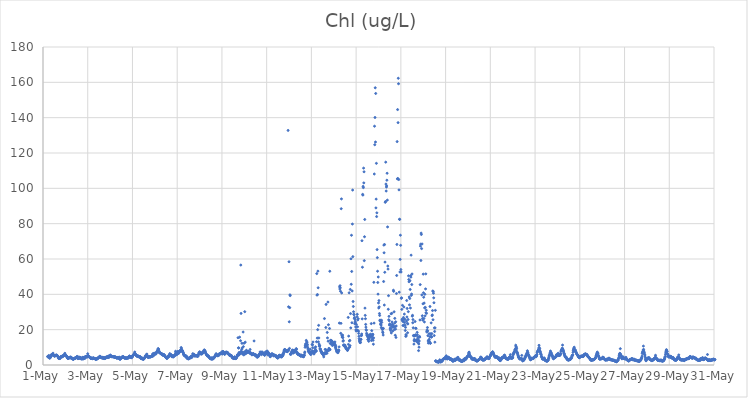
| Category | Chl (ug/L) |
|---|---|
| 44317.208333333336 | 4.81 |
| 44317.21875 | 4.85 |
| 44317.229166666664 | 4.45 |
| 44317.239583333336 | 4.85 |
| 44317.25 | 4.82 |
| 44317.260416666664 | 5.39 |
| 44317.270833333336 | 4.78 |
| 44317.28125 | 4.25 |
| 44317.291666666664 | 3.85 |
| 44317.302083333336 | 4.04 |
| 44317.3125 | 4.4 |
| 44317.322916666664 | 4.07 |
| 44317.333333333336 | 4.47 |
| 44317.34375 | 4.68 |
| 44317.354166666664 | 5.03 |
| 44317.364583333336 | 5.76 |
| 44317.375 | 5.72 |
| 44317.385416666664 | 5.77 |
| 44317.395833333336 | 5.52 |
| 44317.40625 | 5.75 |
| 44317.416666666664 | 5.65 |
| 44317.427083333336 | 5.99 |
| 44317.4375 | 5.89 |
| 44317.447916666664 | 6.69 |
| 44317.458333333336 | 5.69 |
| 44317.46875 | 5.51 |
| 44317.479166666664 | 5.47 |
| 44317.489583333336 | 5.21 |
| 44317.5 | 5.47 |
| 44317.510416666664 | 5.28 |
| 44317.520833333336 | 4.89 |
| 44317.53125 | 5.23 |
| 44317.541666666664 | 5.25 |
| 44317.552083333336 | 5.5 |
| 44317.5625 | 5.34 |
| 44317.572916666664 | 5.44 |
| 44317.583333333336 | 5.46 |
| 44317.59375 | 5.59 |
| 44317.604166666664 | 5.67 |
| 44317.614583333336 | 5.22 |
| 44317.625 | 5.27 |
| 44317.635416666664 | 5.4 |
| 44317.645833333336 | 5.12 |
| 44317.65625 | 4.91 |
| 44317.666666666664 | 4.84 |
| 44317.677083333336 | 4.6 |
| 44317.6875 | 3.92 |
| 44317.697916666664 | 3.87 |
| 44317.708333333336 | 3.83 |
| 44317.71875 | 3.63 |
| 44317.729166666664 | 3.79 |
| 44317.739583333336 | 3.96 |
| 44317.75 | 3.7 |
| 44317.760416666664 | 3.65 |
| 44317.770833333336 | 4.29 |
| 44317.78125 | 4.44 |
| 44317.791666666664 | 4.73 |
| 44317.802083333336 | 4.8 |
| 44317.8125 | 4.52 |
| 44317.822916666664 | 4.49 |
| 44317.833333333336 | 4.74 |
| 44317.84375 | 4.87 |
| 44317.854166666664 | 5 |
| 44317.864583333336 | 4.65 |
| 44317.875 | 5.2 |
| 44317.885416666664 | 5.09 |
| 44317.895833333336 | 5.11 |
| 44317.90625 | 5.05 |
| 44317.916666666664 | 5.09 |
| 44317.927083333336 | 5.32 |
| 44317.9375 | 5.32 |
| 44317.947916666664 | 5.9 |
| 44317.958333333336 | 5.94 |
| 44317.96875 | 5.86 |
| 44317.979166666664 | 6.64 |
| 44317.989583333336 | 5.6 |
| 44318.0 | 5.75 |
| 44318.010416666664 | 5.5 |
| 44318.020833333336 | 5.15 |
| 44318.03125 | 5.32 |
| 44318.041666666664 | 5.27 |
| 44318.052083333336 | 4.87 |
| 44318.0625 | 4.82 |
| 44318.072916666664 | 4.58 |
| 44318.083333333336 | 4.05 |
| 44318.09375 | 4.05 |
| 44318.104166666664 | 3.77 |
| 44318.114583333336 | 3.73 |
| 44318.125 | 3.8 |
| 44318.135416666664 | 3.76 |
| 44318.145833333336 | 3.72 |
| 44318.15625 | 4.08 |
| 44318.166666666664 | 4.21 |
| 44318.177083333336 | 4.1 |
| 44318.1875 | 4.21 |
| 44318.197916666664 | 4.16 |
| 44318.208333333336 | 4.44 |
| 44318.21875 | 4.28 |
| 44318.229166666664 | 4.53 |
| 44318.239583333336 | 4.25 |
| 44318.25 | 3.83 |
| 44318.260416666664 | 4.34 |
| 44318.270833333336 | 4.18 |
| 44318.28125 | 3.96 |
| 44318.291666666664 | 3.74 |
| 44318.302083333336 | 3.68 |
| 44318.3125 | 3.74 |
| 44318.322916666664 | 3.3 |
| 44318.333333333336 | 3.52 |
| 44318.34375 | 3.47 |
| 44318.354166666664 | 3.27 |
| 44318.364583333336 | 3.22 |
| 44318.375 | 3.41 |
| 44318.385416666664 | 3.6 |
| 44318.395833333336 | 3.71 |
| 44318.40625 | 3.84 |
| 44318.416666666664 | 3.76 |
| 44318.427083333336 | 3.89 |
| 44318.4375 | 3.81 |
| 44318.447916666664 | 3.88 |
| 44318.458333333336 | 4.02 |
| 44318.46875 | 3.97 |
| 44318.479166666664 | 4.26 |
| 44318.489583333336 | 4.18 |
| 44318.5 | 4.5 |
| 44318.510416666664 | 4.67 |
| 44318.520833333336 | 4.32 |
| 44318.53125 | 4.84 |
| 44318.541666666664 | 4.33 |
| 44318.552083333336 | 4.32 |
| 44318.5625 | 3.55 |
| 44318.572916666664 | 3.69 |
| 44318.583333333336 | 3.83 |
| 44318.59375 | 4.49 |
| 44318.604166666664 | 3.73 |
| 44318.614583333336 | 4.02 |
| 44318.625 | 3.79 |
| 44318.635416666664 | 4.18 |
| 44318.645833333336 | 4.45 |
| 44318.65625 | 3.92 |
| 44318.666666666664 | 4.13 |
| 44318.677083333336 | 4.22 |
| 44318.6875 | 3.85 |
| 44318.697916666664 | 3.49 |
| 44318.708333333336 | 3.87 |
| 44318.71875 | 3.77 |
| 44318.729166666664 | 3.4 |
| 44318.739583333336 | 3.48 |
| 44318.75 | 3.83 |
| 44318.760416666664 | 3.43 |
| 44318.770833333336 | 4.31 |
| 44318.78125 | 3.69 |
| 44318.791666666664 | 4.34 |
| 44318.802083333336 | 3.43 |
| 44318.8125 | 3.86 |
| 44318.822916666664 | 3.96 |
| 44318.833333333336 | 3.68 |
| 44318.84375 | 4.44 |
| 44318.854166666664 | 4.41 |
| 44318.864583333336 | 3.72 |
| 44318.875 | 4.19 |
| 44318.885416666664 | 3.99 |
| 44318.895833333336 | 4.65 |
| 44318.90625 | 4.74 |
| 44318.916666666664 | 4.36 |
| 44318.927083333336 | 4.71 |
| 44318.9375 | 4.94 |
| 44318.947916666664 | 4.82 |
| 44318.958333333336 | 4.78 |
| 44318.96875 | 4.59 |
| 44318.979166666664 | 4.57 |
| 44318.989583333336 | 5.17 |
| 44319.0 | 6.39 |
| 44319.010416666664 | 5.13 |
| 44319.020833333336 | 5.16 |
| 44319.03125 | 5.22 |
| 44319.041666666664 | 4.88 |
| 44319.052083333336 | 4.74 |
| 44319.0625 | 4.81 |
| 44319.072916666664 | 4.44 |
| 44319.083333333336 | 4.4 |
| 44319.09375 | 4.3 |
| 44319.104166666664 | 4.36 |
| 44319.114583333336 | 4 |
| 44319.125 | 3.89 |
| 44319.135416666664 | 3.79 |
| 44319.145833333336 | 3.67 |
| 44319.15625 | 4.06 |
| 44319.166666666664 | 3.71 |
| 44319.177083333336 | 3.77 |
| 44319.1875 | 3.81 |
| 44319.197916666664 | 3.83 |
| 44319.208333333336 | 3.69 |
| 44319.21875 | 3.54 |
| 44319.229166666664 | 3.92 |
| 44319.239583333336 | 3.96 |
| 44319.25 | 3.73 |
| 44319.260416666664 | 4.08 |
| 44319.270833333336 | 3.78 |
| 44319.28125 | 3.71 |
| 44319.291666666664 | 3.76 |
| 44319.302083333336 | 3.68 |
| 44319.3125 | 3.63 |
| 44319.322916666664 | 3.58 |
| 44319.333333333336 | 3.36 |
| 44319.34375 | 3.58 |
| 44319.354166666664 | 3.42 |
| 44319.364583333336 | 3.1 |
| 44319.375 | 3.5 |
| 44319.385416666664 | 3.53 |
| 44319.395833333336 | 3.39 |
| 44319.40625 | 3.7 |
| 44319.416666666664 | 3.5 |
| 44319.427083333336 | 3.45 |
| 44319.4375 | 3.75 |
| 44319.447916666664 | 3.83 |
| 44319.458333333336 | 3.99 |
| 44319.46875 | 4.03 |
| 44319.479166666664 | 4 |
| 44319.489583333336 | 4.19 |
| 44319.5 | 4.23 |
| 44319.510416666664 | 4.58 |
| 44319.520833333336 | 4.36 |
| 44319.53125 | 4.75 |
| 44319.541666666664 | 4.96 |
| 44319.552083333336 | 4.94 |
| 44319.5625 | 4.72 |
| 44319.572916666664 | 4.5 |
| 44319.583333333336 | 4.29 |
| 44319.59375 | 4.15 |
| 44319.604166666664 | 4.24 |
| 44319.614583333336 | 4.04 |
| 44319.625 | 4.32 |
| 44319.635416666664 | 4.29 |
| 44319.645833333336 | 3.99 |
| 44319.65625 | 4.31 |
| 44319.666666666664 | 4.28 |
| 44319.677083333336 | 3.98 |
| 44319.6875 | 3.69 |
| 44319.697916666664 | 4.24 |
| 44319.708333333336 | 3.84 |
| 44319.71875 | 3.77 |
| 44319.729166666664 | 4.21 |
| 44319.739583333336 | 3.97 |
| 44319.75 | 4.08 |
| 44319.760416666664 | 3.64 |
| 44319.770833333336 | 3.96 |
| 44319.78125 | 3.77 |
| 44319.791666666664 | 3.88 |
| 44319.802083333336 | 4.34 |
| 44319.8125 | 4.19 |
| 44319.822916666664 | 4.09 |
| 44319.833333333336 | 4.43 |
| 44319.84375 | 4.54 |
| 44319.854166666664 | 4.52 |
| 44319.864583333336 | 4.46 |
| 44319.875 | 4.59 |
| 44319.885416666664 | 4.56 |
| 44319.895833333336 | 4.61 |
| 44319.90625 | 4.11 |
| 44319.916666666664 | 4.52 |
| 44319.927083333336 | 5.12 |
| 44319.9375 | 4.52 |
| 44319.947916666664 | 4.63 |
| 44319.958333333336 | 4.4 |
| 44319.96875 | 4.76 |
| 44319.979166666664 | 4.89 |
| 44319.989583333336 | 4.91 |
| 44320.0 | 5.08 |
| 44320.010416666664 | 5.67 |
| 44320.020833333336 | 5.33 |
| 44320.03125 | 5.2 |
| 44320.041666666664 | 5.05 |
| 44320.052083333336 | 4.81 |
| 44320.0625 | 4.9 |
| 44320.072916666664 | 4.72 |
| 44320.083333333336 | 4.65 |
| 44320.09375 | 4.65 |
| 44320.104166666664 | 4.8 |
| 44320.114583333336 | 4.74 |
| 44320.125 | 4.76 |
| 44320.135416666664 | 4.7 |
| 44320.145833333336 | 4.66 |
| 44320.15625 | 4.56 |
| 44320.166666666664 | 4.71 |
| 44320.177083333336 | 4.66 |
| 44320.1875 | 4.62 |
| 44320.197916666664 | 4.26 |
| 44320.208333333336 | 4.37 |
| 44320.21875 | 4.7 |
| 44320.229166666664 | 4.57 |
| 44320.239583333336 | 4.31 |
| 44320.25 | 4.36 |
| 44320.260416666664 | 4.39 |
| 44320.270833333336 | 4.21 |
| 44320.28125 | 4.07 |
| 44320.291666666664 | 3.98 |
| 44320.302083333336 | 4.24 |
| 44320.3125 | 3.8 |
| 44320.322916666664 | 3.99 |
| 44320.333333333336 | 4.14 |
| 44320.34375 | 4.27 |
| 44320.354166666664 | 4.17 |
| 44320.364583333336 | 3.86 |
| 44320.375 | 4.12 |
| 44320.385416666664 | 4.12 |
| 44320.395833333336 | 3.8 |
| 44320.40625 | 4.47 |
| 44320.416666666664 | 3.95 |
| 44320.427083333336 | 3.52 |
| 44320.4375 | 3.31 |
| 44320.447916666664 | 3.23 |
| 44320.458333333336 | 3.42 |
| 44320.46875 | 3.77 |
| 44320.479166666664 | 3.85 |
| 44320.489583333336 | 3.78 |
| 44320.5 | 4.09 |
| 44320.510416666664 | 4.31 |
| 44320.520833333336 | 4.43 |
| 44320.53125 | 4.38 |
| 44320.541666666664 | 4.39 |
| 44320.552083333336 | 4.39 |
| 44320.5625 | 4.28 |
| 44320.572916666664 | 4.81 |
| 44320.583333333336 | 4.76 |
| 44320.59375 | 4.49 |
| 44320.604166666664 | 4.38 |
| 44320.614583333336 | 4.47 |
| 44320.625 | 4.1 |
| 44320.635416666664 | 3.96 |
| 44320.645833333336 | 4.17 |
| 44320.65625 | 3.86 |
| 44320.666666666664 | 3.9 |
| 44320.677083333336 | 3.93 |
| 44320.6875 | 3.89 |
| 44320.697916666664 | 4.13 |
| 44320.708333333336 | 3.86 |
| 44320.71875 | 3.72 |
| 44320.729166666664 | 3.97 |
| 44320.739583333336 | 3.85 |
| 44320.75 | 3.76 |
| 44320.760416666664 | 3.87 |
| 44320.770833333336 | 4.29 |
| 44320.78125 | 3.96 |
| 44320.791666666664 | 3.99 |
| 44320.802083333336 | 4.09 |
| 44320.8125 | 3.98 |
| 44320.822916666664 | 4.11 |
| 44320.833333333336 | 4.46 |
| 44320.84375 | 4.62 |
| 44320.854166666664 | 4.85 |
| 44320.864583333336 | 5.09 |
| 44320.875 | 4.99 |
| 44320.885416666664 | 4.56 |
| 44320.895833333336 | 4.4 |
| 44320.90625 | 4.34 |
| 44320.916666666664 | 4.54 |
| 44320.927083333336 | 4.55 |
| 44320.9375 | 4.62 |
| 44320.947916666664 | 4.14 |
| 44320.958333333336 | 4.5 |
| 44320.96875 | 4.23 |
| 44320.979166666664 | 4.47 |
| 44320.989583333336 | 4.87 |
| 44321.0 | 4.69 |
| 44321.010416666664 | 5.19 |
| 44321.020833333336 | 5.42 |
| 44321.03125 | 5.58 |
| 44321.041666666664 | 5.81 |
| 44321.052083333336 | 5.83 |
| 44321.0625 | 6.03 |
| 44321.072916666664 | 6.03 |
| 44321.083333333336 | 5.93 |
| 44321.09375 | 6.78 |
| 44321.104166666664 | 7.36 |
| 44321.114583333336 | 6.44 |
| 44321.125 | 6.39 |
| 44321.135416666664 | 6.1 |
| 44321.145833333336 | 5.78 |
| 44321.15625 | 5.72 |
| 44321.166666666664 | 5.42 |
| 44321.177083333336 | 5.26 |
| 44321.1875 | 5.44 |
| 44321.197916666664 | 5.08 |
| 44321.208333333336 | 4.89 |
| 44321.21875 | 5.07 |
| 44321.229166666664 | 4.98 |
| 44321.239583333336 | 4.83 |
| 44321.25 | 5.25 |
| 44321.260416666664 | 4.88 |
| 44321.270833333336 | 4.78 |
| 44321.28125 | 4.65 |
| 44321.291666666664 | 4.87 |
| 44321.302083333336 | 4.59 |
| 44321.3125 | 4.75 |
| 44321.322916666664 | 4.53 |
| 44321.333333333336 | 4.84 |
| 44321.34375 | 4.26 |
| 44321.354166666664 | 4.54 |
| 44321.364583333336 | 4.06 |
| 44321.375 | 3.82 |
| 44321.385416666664 | 3.71 |
| 44321.395833333336 | 3.56 |
| 44321.40625 | 3.92 |
| 44321.416666666664 | 4.11 |
| 44321.427083333336 | 3.58 |
| 44321.4375 | 3.79 |
| 44321.447916666664 | 3.69 |
| 44321.458333333336 | 3.44 |
| 44321.46875 | 3.19 |
| 44321.479166666664 | 3.56 |
| 44321.489583333336 | 3.42 |
| 44321.5 | 3.27 |
| 44321.510416666664 | 3.47 |
| 44321.520833333336 | 3.66 |
| 44321.53125 | 3.76 |
| 44321.541666666664 | 4.11 |
| 44321.552083333336 | 4.35 |
| 44321.5625 | 4.36 |
| 44321.572916666664 | 4.95 |
| 44321.583333333336 | 5.27 |
| 44321.59375 | 4.64 |
| 44321.604166666664 | 5.17 |
| 44321.614583333336 | 5.24 |
| 44321.625 | 5.94 |
| 44321.635416666664 | 5.73 |
| 44321.645833333336 | 6.18 |
| 44321.65625 | 5.33 |
| 44321.666666666664 | 5.08 |
| 44321.677083333336 | 4.57 |
| 44321.6875 | 4.64 |
| 44321.697916666664 | 4.28 |
| 44321.708333333336 | 4.49 |
| 44321.71875 | 4.47 |
| 44321.729166666664 | 4.62 |
| 44321.739583333336 | 4.33 |
| 44321.75 | 4.7 |
| 44321.760416666664 | 4.62 |
| 44321.770833333336 | 4.66 |
| 44321.78125 | 4.76 |
| 44321.791666666664 | 4.73 |
| 44321.802083333336 | 4.46 |
| 44321.8125 | 4.74 |
| 44321.822916666664 | 4.6 |
| 44321.833333333336 | 4.94 |
| 44321.84375 | 4.97 |
| 44321.854166666664 | 4.92 |
| 44321.864583333336 | 5.15 |
| 44321.875 | 5.18 |
| 44321.885416666664 | 4.96 |
| 44321.895833333336 | 4.94 |
| 44321.90625 | 6.2 |
| 44321.916666666664 | 6.32 |
| 44321.927083333336 | 6.07 |
| 44321.9375 | 5.19 |
| 44321.947916666664 | 5.55 |
| 44321.958333333336 | 6.06 |
| 44321.96875 | 6.71 |
| 44321.979166666664 | 6.24 |
| 44321.989583333336 | 6.31 |
| 44322.0 | 6.5 |
| 44322.010416666664 | 6.54 |
| 44322.020833333336 | 6.3 |
| 44322.03125 | 6.3 |
| 44322.041666666664 | 6.24 |
| 44322.052083333336 | 6.28 |
| 44322.0625 | 6.69 |
| 44322.072916666664 | 7.16 |
| 44322.083333333336 | 7.2 |
| 44322.09375 | 7.47 |
| 44322.104166666664 | 7.62 |
| 44322.114583333336 | 8.1 |
| 44322.125 | 8.38 |
| 44322.135416666664 | 8.47 |
| 44322.145833333336 | 9.29 |
| 44322.15625 | 9.1 |
| 44322.166666666664 | 8.87 |
| 44322.177083333336 | 8.31 |
| 44322.1875 | 7.48 |
| 44322.197916666664 | 7.12 |
| 44322.208333333336 | 7.01 |
| 44322.21875 | 6.96 |
| 44322.229166666664 | 6.97 |
| 44322.239583333336 | 6.79 |
| 44322.25 | 6.74 |
| 44322.260416666664 | 6.55 |
| 44322.270833333336 | 6.63 |
| 44322.28125 | 6.37 |
| 44322.291666666664 | 6.14 |
| 44322.302083333336 | 6.11 |
| 44322.3125 | 6.2 |
| 44322.322916666664 | 5.89 |
| 44322.333333333336 | 5.96 |
| 44322.34375 | 6.22 |
| 44322.354166666664 | 6.04 |
| 44322.364583333336 | 5.37 |
| 44322.375 | 5.83 |
| 44322.385416666664 | 5.67 |
| 44322.395833333336 | 5.6 |
| 44322.40625 | 5.83 |
| 44322.416666666664 | 5.81 |
| 44322.427083333336 | 5.6 |
| 44322.4375 | 5.18 |
| 44322.447916666664 | 5.03 |
| 44322.458333333336 | 4.9 |
| 44322.46875 | 4.56 |
| 44322.479166666664 | 4.77 |
| 44322.489583333336 | 4.4 |
| 44322.5 | 4.26 |
| 44322.510416666664 | 4.05 |
| 44322.520833333336 | 4.05 |
| 44322.53125 | 3.85 |
| 44322.541666666664 | 3.63 |
| 44322.552083333336 | 4.13 |
| 44322.5625 | 4.13 |
| 44322.572916666664 | 4.28 |
| 44322.583333333336 | 4.45 |
| 44322.59375 | 4.6 |
| 44322.604166666664 | 5.23 |
| 44322.614583333336 | 5.09 |
| 44322.625 | 5.15 |
| 44322.635416666664 | 4.68 |
| 44322.645833333336 | 5.41 |
| 44322.65625 | 5.66 |
| 44322.666666666664 | 6.46 |
| 44322.677083333336 | 5.59 |
| 44322.6875 | 6.03 |
| 44322.697916666664 | 5.96 |
| 44322.708333333336 | 5.73 |
| 44322.71875 | 5.65 |
| 44322.729166666664 | 5.8 |
| 44322.739583333336 | 5.51 |
| 44322.75 | 5.27 |
| 44322.760416666664 | 4.71 |
| 44322.770833333336 | 4.91 |
| 44322.78125 | 5.36 |
| 44322.791666666664 | 4.81 |
| 44322.802083333336 | 4.61 |
| 44322.8125 | 4.81 |
| 44322.822916666664 | 4.77 |
| 44322.833333333336 | 4.56 |
| 44322.84375 | 5.06 |
| 44322.854166666664 | 5.15 |
| 44322.864583333336 | 5.18 |
| 44322.875 | 5.34 |
| 44322.885416666664 | 5.64 |
| 44322.895833333336 | 5.31 |
| 44322.90625 | 6 |
| 44322.916666666664 | 5.78 |
| 44322.927083333336 | 7.78 |
| 44322.9375 | 6.92 |
| 44322.947916666664 | 6.74 |
| 44322.958333333336 | 6.54 |
| 44322.96875 | 5.91 |
| 44322.979166666664 | 5.83 |
| 44322.989583333336 | 6.7 |
| 44323.0 | 7.16 |
| 44323.010416666664 | 7.07 |
| 44323.020833333336 | 7.69 |
| 44323.03125 | 7.1 |
| 44323.041666666664 | 7.54 |
| 44323.052083333336 | 6.55 |
| 44323.0625 | 6.57 |
| 44323.072916666664 | 6.99 |
| 44323.083333333336 | 7.09 |
| 44323.09375 | 7.76 |
| 44323.104166666664 | 7.64 |
| 44323.114583333336 | 7.82 |
| 44323.125 | 7.7 |
| 44323.135416666664 | 7.68 |
| 44323.145833333336 | 8.37 |
| 44323.15625 | 8.34 |
| 44323.166666666664 | 8.64 |
| 44323.177083333336 | 9.9 |
| 44323.1875 | 9.44 |
| 44323.197916666664 | 8.72 |
| 44323.208333333336 | 8.18 |
| 44323.21875 | 8.34 |
| 44323.229166666664 | 7.86 |
| 44323.239583333336 | 7.35 |
| 44323.25 | 7.8 |
| 44323.260416666664 | 7 |
| 44323.270833333336 | 7.04 |
| 44323.28125 | 6.24 |
| 44323.291666666664 | 5.92 |
| 44323.302083333336 | 5.45 |
| 44323.3125 | 5.82 |
| 44323.322916666664 | 5.59 |
| 44323.333333333336 | 5.49 |
| 44323.34375 | 5.08 |
| 44323.354166666664 | 5.46 |
| 44323.364583333336 | 4.85 |
| 44323.375 | 5.19 |
| 44323.385416666664 | 4.87 |
| 44323.395833333336 | 4.65 |
| 44323.40625 | 5.01 |
| 44323.416666666664 | 4.9 |
| 44323.427083333336 | 3.96 |
| 44323.4375 | 3.96 |
| 44323.447916666664 | 4.27 |
| 44323.458333333336 | 3.76 |
| 44323.46875 | 3.82 |
| 44323.479166666664 | 3.67 |
| 44323.489583333336 | 3.44 |
| 44323.5 | 3.92 |
| 44323.510416666664 | 3.51 |
| 44323.520833333336 | 3.74 |
| 44323.53125 | 3.96 |
| 44323.541666666664 | 3.68 |
| 44323.552083333336 | 3.66 |
| 44323.5625 | 3.94 |
| 44323.572916666664 | 4.06 |
| 44323.583333333336 | 4.45 |
| 44323.59375 | 4.44 |
| 44323.604166666664 | 4.48 |
| 44323.614583333336 | 4.41 |
| 44323.625 | 5.01 |
| 44323.635416666664 | 4.2 |
| 44323.645833333336 | 4.61 |
| 44323.65625 | 4.6 |
| 44323.666666666664 | 4.47 |
| 44323.677083333336 | 4.85 |
| 44323.6875 | 5.15 |
| 44323.697916666664 | 6.43 |
| 44323.708333333336 | 5.82 |
| 44323.71875 | 5.83 |
| 44323.729166666664 | 5.74 |
| 44323.739583333336 | 5.74 |
| 44323.75 | 6.11 |
| 44323.760416666664 | 5.65 |
| 44323.770833333336 | 5.46 |
| 44323.78125 | 5.36 |
| 44323.791666666664 | 4.95 |
| 44323.802083333336 | 5.43 |
| 44323.8125 | 5.34 |
| 44323.822916666664 | 5.3 |
| 44323.833333333336 | 5.2 |
| 44323.84375 | 5.32 |
| 44323.854166666664 | 5.19 |
| 44323.864583333336 | 5.21 |
| 44323.875 | 5.24 |
| 44323.885416666664 | 5.14 |
| 44323.895833333336 | 5.09 |
| 44323.90625 | 5 |
| 44323.916666666664 | 4.98 |
| 44323.927083333336 | 4.93 |
| 44323.9375 | 5.52 |
| 44323.947916666664 | 6 |
| 44323.958333333336 | 5.97 |
| 44323.96875 | 6.79 |
| 44323.979166666664 | 6.93 |
| 44323.989583333336 | 6.51 |
| 44324.0 | 7.48 |
| 44324.010416666664 | 7.09 |
| 44324.020833333336 | 7.23 |
| 44324.03125 | 7.12 |
| 44324.041666666664 | 7.02 |
| 44324.052083333336 | 6.28 |
| 44324.0625 | 6.8 |
| 44324.072916666664 | 6.73 |
| 44324.083333333336 | 6.16 |
| 44324.09375 | 6.34 |
| 44324.104166666664 | 6.8 |
| 44324.114583333336 | 6.34 |
| 44324.125 | 6.62 |
| 44324.135416666664 | 6.71 |
| 44324.145833333336 | 7.09 |
| 44324.15625 | 7.37 |
| 44324.166666666664 | 7.67 |
| 44324.177083333336 | 7.77 |
| 44324.1875 | 7.43 |
| 44324.197916666664 | 7.88 |
| 44324.208333333336 | 8.56 |
| 44324.21875 | 8.34 |
| 44324.229166666664 | 7.75 |
| 44324.239583333336 | 8.11 |
| 44324.25 | 7.66 |
| 44324.260416666664 | 7.25 |
| 44324.270833333336 | 6.81 |
| 44324.28125 | 6.61 |
| 44324.291666666664 | 6.35 |
| 44324.302083333336 | 5.86 |
| 44324.3125 | 5.98 |
| 44324.322916666664 | 5.66 |
| 44324.333333333336 | 5.47 |
| 44324.34375 | 5.13 |
| 44324.354166666664 | 5.26 |
| 44324.364583333336 | 5.29 |
| 44324.375 | 5.11 |
| 44324.385416666664 | 5.32 |
| 44324.395833333336 | 4.84 |
| 44324.40625 | 4.85 |
| 44324.416666666664 | 4.63 |
| 44324.427083333336 | 4.43 |
| 44324.4375 | 4.32 |
| 44324.447916666664 | 4.06 |
| 44324.458333333336 | 3.94 |
| 44324.46875 | 3.84 |
| 44324.479166666664 | 3.68 |
| 44324.489583333336 | 3.74 |
| 44324.5 | 3.49 |
| 44324.510416666664 | 3.55 |
| 44324.520833333336 | 3.47 |
| 44324.53125 | 3.75 |
| 44324.541666666664 | 3.28 |
| 44324.552083333336 | 4.09 |
| 44324.5625 | 4.1 |
| 44324.572916666664 | 3.54 |
| 44324.583333333336 | 3.34 |
| 44324.59375 | 3.61 |
| 44324.604166666664 | 3.61 |
| 44324.614583333336 | 3.61 |
| 44324.625 | 3.99 |
| 44324.635416666664 | 4.28 |
| 44324.645833333336 | 4.22 |
| 44324.65625 | 4.16 |
| 44324.666666666664 | 4.45 |
| 44324.677083333336 | 4.47 |
| 44324.6875 | 4.85 |
| 44324.697916666664 | 5.27 |
| 44324.708333333336 | 5.47 |
| 44324.71875 | 5.65 |
| 44324.729166666664 | 5.38 |
| 44324.739583333336 | 6.42 |
| 44324.75 | 5.89 |
| 44324.760416666664 | 5.98 |
| 44324.770833333336 | 5.62 |
| 44324.78125 | 5.63 |
| 44324.791666666664 | 5.31 |
| 44324.802083333336 | 5.34 |
| 44324.8125 | 5.32 |
| 44324.822916666664 | 5.2 |
| 44324.833333333336 | 5.39 |
| 44324.84375 | 5.44 |
| 44324.854166666664 | 5.46 |
| 44324.864583333336 | 5.69 |
| 44324.875 | 6.33 |
| 44324.885416666664 | 6 |
| 44324.895833333336 | 6.11 |
| 44324.90625 | 6.24 |
| 44324.916666666664 | 6.48 |
| 44324.927083333336 | 6.45 |
| 44324.9375 | 6.42 |
| 44324.947916666664 | 6.64 |
| 44324.958333333336 | 6.78 |
| 44324.96875 | 6.72 |
| 44324.979166666664 | 6.45 |
| 44324.989583333336 | 7.07 |
| 44325.0 | 7.03 |
| 44325.010416666664 | 7.6 |
| 44325.020833333336 | 6.19 |
| 44325.03125 | 7.04 |
| 44325.041666666664 | 7.31 |
| 44325.052083333336 | 7.51 |
| 44325.0625 | 7.6 |
| 44325.072916666664 | 7.31 |
| 44325.083333333336 | 6.97 |
| 44325.09375 | 6.7 |
| 44325.104166666664 | 6.69 |
| 44325.114583333336 | 6.14 |
| 44325.125 | 6.1 |
| 44325.135416666664 | 6.27 |
| 44325.145833333336 | 6.57 |
| 44325.15625 | 7.21 |
| 44325.166666666664 | 6.86 |
| 44325.177083333336 | 6.88 |
| 44325.1875 | 6.96 |
| 44325.197916666664 | 7.12 |
| 44325.208333333336 | 7.29 |
| 44325.21875 | 7.21 |
| 44325.229166666664 | 7.05 |
| 44325.239583333336 | 6.72 |
| 44325.25 | 7.12 |
| 44325.260416666664 | 6.92 |
| 44325.270833333336 | 6.54 |
| 44325.28125 | 6.4 |
| 44325.291666666664 | 6.36 |
| 44325.302083333336 | 6.04 |
| 44325.3125 | 5.79 |
| 44325.322916666664 | 6 |
| 44325.333333333336 | 5.68 |
| 44325.34375 | 5.49 |
| 44325.354166666664 | 5.39 |
| 44325.364583333336 | 5.45 |
| 44325.375 | 5.68 |
| 44325.385416666664 | 5.48 |
| 44325.395833333336 | 5.46 |
| 44325.40625 | 5.17 |
| 44325.416666666664 | 5.3 |
| 44325.427083333336 | 5.31 |
| 44325.4375 | 4.83 |
| 44325.447916666664 | 4.56 |
| 44325.458333333336 | 4.37 |
| 44325.46875 | 3.97 |
| 44325.479166666664 | 4.22 |
| 44325.489583333336 | 4.31 |
| 44325.5 | 3.87 |
| 44325.510416666664 | 3.81 |
| 44325.520833333336 | 3.89 |
| 44325.53125 | 3.64 |
| 44325.541666666664 | 3.62 |
| 44325.552083333336 | 3.83 |
| 44325.5625 | 3.87 |
| 44325.572916666664 | 4.69 |
| 44325.583333333336 | 4.2 |
| 44325.59375 | 4.22 |
| 44325.604166666664 | 3.89 |
| 44325.614583333336 | 3.62 |
| 44325.625 | 3.73 |
| 44325.635416666664 | 3.75 |
| 44325.645833333336 | 4.08 |
| 44325.65625 | 4.55 |
| 44325.666666666664 | 4.71 |
| 44325.677083333336 | 4.66 |
| 44325.6875 | 5.68 |
| 44325.697916666664 | 5.64 |
| 44325.708333333336 | 5.89 |
| 44325.71875 | 15.43 |
| 44325.729166666664 | 5.45 |
| 44325.739583333336 | 9.7 |
| 44325.75 | 9.65 |
| 44325.760416666664 | 7.03 |
| 44325.770833333336 | 5.78 |
| 44325.78125 | 6.09 |
| 44325.791666666664 | 15.77 |
| 44325.802083333336 | 6.57 |
| 44325.8125 | 7.18 |
| 44325.822916666664 | 6.61 |
| 44325.833333333336 | 13.74 |
| 44325.84375 | 56.57 |
| 44325.854166666664 | 29.2 |
| 44325.864583333336 | 7.85 |
| 44325.875 | 7.53 |
| 44325.885416666664 | 8.88 |
| 44325.895833333336 | 12.26 |
| 44325.90625 | 9.65 |
| 44325.916666666664 | 6.21 |
| 44325.927083333336 | 6.98 |
| 44325.9375 | 6.54 |
| 44325.947916666664 | 18.67 |
| 44325.958333333336 | 10.39 |
| 44325.96875 | 6.39 |
| 44325.979166666664 | 5.69 |
| 44325.989583333336 | 12.3 |
| 44326.0 | 7.44 |
| 44326.010416666664 | 6.43 |
| 44326.020833333336 | 30.18 |
| 44326.03125 | 7.41 |
| 44326.041666666664 | 12.92 |
| 44326.052083333336 | 6.58 |
| 44326.0625 | 6.35 |
| 44326.072916666664 | 7.66 |
| 44326.083333333336 | 7.15 |
| 44326.09375 | 8.33 |
| 44326.104166666664 | 7.97 |
| 44326.114583333336 | 7.57 |
| 44326.125 | 6.96 |
| 44326.135416666664 | 7.34 |
| 44326.145833333336 | 7.17 |
| 44326.15625 | 7.55 |
| 44326.166666666664 | 7.69 |
| 44326.177083333336 | 7.59 |
| 44326.1875 | 7.67 |
| 44326.197916666664 | 7.53 |
| 44326.208333333336 | 7.33 |
| 44326.21875 | 7.18 |
| 44326.229166666664 | 6.82 |
| 44326.239583333336 | 7.09 |
| 44326.25 | 7.23 |
| 44326.260416666664 | 8.78 |
| 44326.270833333336 | 6.49 |
| 44326.28125 | 6.54 |
| 44326.291666666664 | 6.78 |
| 44326.302083333336 | 6.44 |
| 44326.3125 | 6.46 |
| 44326.322916666664 | 6.54 |
| 44326.333333333336 | 5.91 |
| 44326.34375 | 5.7 |
| 44326.354166666664 | 6.06 |
| 44326.364583333336 | 6.06 |
| 44326.375 | 6.17 |
| 44326.385416666664 | 6.14 |
| 44326.395833333336 | 6.17 |
| 44326.40625 | 6.39 |
| 44326.416666666664 | 6.38 |
| 44326.427083333336 | 5.85 |
| 44326.4375 | 13.61 |
| 44326.447916666664 | 5.76 |
| 44326.458333333336 | 5.7 |
| 44326.46875 | 5.65 |
| 44326.479166666664 | 5.63 |
| 44326.489583333336 | 5.65 |
| 44326.5 | 5.74 |
| 44326.510416666664 | 5.77 |
| 44326.520833333336 | 5.55 |
| 44326.53125 | 5.17 |
| 44326.541666666664 | 5.46 |
| 44326.552083333336 | 4.55 |
| 44326.5625 | 4.89 |
| 44326.572916666664 | 4.73 |
| 44326.583333333336 | 4.83 |
| 44326.59375 | 4.38 |
| 44326.604166666664 | 4.65 |
| 44326.614583333336 | 4.71 |
| 44326.625 | 5.02 |
| 44326.635416666664 | 4.98 |
| 44326.645833333336 | 5.86 |
| 44326.65625 | 5.64 |
| 44326.666666666664 | 5.66 |
| 44326.677083333336 | 6.07 |
| 44326.6875 | 6.52 |
| 44326.697916666664 | 6.42 |
| 44326.708333333336 | 7.42 |
| 44326.71875 | 6.86 |
| 44326.729166666664 | 6.76 |
| 44326.739583333336 | 7.15 |
| 44326.75 | 6.62 |
| 44326.760416666664 | 6.52 |
| 44326.770833333336 | 5.86 |
| 44326.78125 | 6.47 |
| 44326.791666666664 | 7.45 |
| 44326.802083333336 | 6.88 |
| 44326.8125 | 6.62 |
| 44326.822916666664 | 6.56 |
| 44326.833333333336 | 6.49 |
| 44326.84375 | 6.61 |
| 44326.854166666664 | 6.72 |
| 44326.864583333336 | 6.47 |
| 44326.875 | 6.35 |
| 44326.885416666664 | 6.39 |
| 44326.895833333336 | 5.85 |
| 44326.90625 | 5.5 |
| 44326.916666666664 | 5.64 |
| 44326.927083333336 | 5.82 |
| 44326.9375 | 6.26 |
| 44326.947916666664 | 7.41 |
| 44326.958333333336 | 6.38 |
| 44326.96875 | 6.44 |
| 44326.979166666664 | 6.97 |
| 44326.989583333336 | 6.82 |
| 44327.0 | 7.36 |
| 44327.010416666664 | 7.28 |
| 44327.020833333336 | 7.94 |
| 44327.03125 | 7.51 |
| 44327.041666666664 | 7.1 |
| 44327.052083333336 | 7.42 |
| 44327.0625 | 5.59 |
| 44327.072916666664 | 6.43 |
| 44327.083333333336 | 6.66 |
| 44327.09375 | 6.41 |
| 44327.104166666664 | 6.55 |
| 44327.114583333336 | 5.94 |
| 44327.125 | 5.73 |
| 44327.135416666664 | 5.55 |
| 44327.145833333336 | 5.25 |
| 44327.15625 | 4.66 |
| 44327.166666666664 | 4.84 |
| 44327.177083333336 | 4.92 |
| 44327.1875 | 5.61 |
| 44327.197916666664 | 5.96 |
| 44327.208333333336 | 6.21 |
| 44327.21875 | 5.9 |
| 44327.229166666664 | 6.27 |
| 44327.239583333336 | 6.23 |
| 44327.25 | 5.95 |
| 44327.260416666664 | 6.31 |
| 44327.270833333336 | 5.95 |
| 44327.28125 | 6.01 |
| 44327.291666666664 | 5.89 |
| 44327.302083333336 | 5.17 |
| 44327.3125 | 5.52 |
| 44327.322916666664 | 5.35 |
| 44327.333333333336 | 5.7 |
| 44327.34375 | 5.52 |
| 44327.354166666664 | 5.26 |
| 44327.364583333336 | 5.48 |
| 44327.375 | 5.2 |
| 44327.385416666664 | 5.33 |
| 44327.395833333336 | 5.26 |
| 44327.40625 | 5.46 |
| 44327.416666666664 | 5.08 |
| 44327.427083333336 | 4.83 |
| 44327.4375 | 4.66 |
| 44327.447916666664 | 4.27 |
| 44327.458333333336 | 4.44 |
| 44327.46875 | 4.25 |
| 44327.479166666664 | 4.07 |
| 44327.489583333336 | 3.97 |
| 44327.5 | 4.03 |
| 44327.510416666664 | 4.11 |
| 44327.520833333336 | 4.18 |
| 44327.53125 | 5.24 |
| 44327.541666666664 | 5.15 |
| 44327.552083333336 | 5.26 |
| 44327.5625 | 5.28 |
| 44327.572916666664 | 4.82 |
| 44327.583333333336 | 5.58 |
| 44327.59375 | 5.43 |
| 44327.604166666664 | 4.63 |
| 44327.614583333336 | 4.98 |
| 44327.625 | 5.29 |
| 44327.635416666664 | 5.24 |
| 44327.645833333336 | 4.75 |
| 44327.65625 | 5.07 |
| 44327.666666666664 | 4.47 |
| 44327.677083333336 | 5.13 |
| 44327.6875 | 5.33 |
| 44327.697916666664 | 4.91 |
| 44327.708333333336 | 5.25 |
| 44327.71875 | 5.61 |
| 44327.729166666664 | 6.45 |
| 44327.739583333336 | 5.68 |
| 44327.75 | 6.29 |
| 44327.760416666664 | 6.87 |
| 44327.770833333336 | 7.54 |
| 44327.78125 | 8.14 |
| 44327.791666666664 | 8.61 |
| 44327.802083333336 | 8.74 |
| 44327.8125 | 8.8 |
| 44327.822916666664 | 8.51 |
| 44327.833333333336 | 8.11 |
| 44327.84375 | 8.17 |
| 44327.854166666664 | 8.26 |
| 44327.864583333336 | 7.72 |
| 44327.875 | 7.84 |
| 44327.885416666664 | 7.82 |
| 44327.895833333336 | 8.06 |
| 44327.90625 | 7.98 |
| 44327.916666666664 | 7.72 |
| 44327.927083333336 | 7.56 |
| 44327.9375 | 7.88 |
| 44327.947916666664 | 7.86 |
| 44327.958333333336 | 132.78 |
| 44327.96875 | 8.67 |
| 44327.979166666664 | 32.93 |
| 44327.989583333336 | 8.29 |
| 44328.0 | 58.44 |
| 44328.010416666664 | 24.45 |
| 44328.020833333336 | 9.4 |
| 44328.03125 | 32.46 |
| 44328.041666666664 | 39.72 |
| 44328.052083333336 | 39.27 |
| 44328.0625 | 6.03 |
| 44328.072916666664 | 6.49 |
| 44328.083333333336 | 6 |
| 44328.09375 | 6.42 |
| 44328.104166666664 | 6.83 |
| 44328.114583333336 | 7.18 |
| 44328.125 | 7.54 |
| 44328.135416666664 | 7.45 |
| 44328.145833333336 | 8.47 |
| 44328.15625 | 7.75 |
| 44328.166666666664 | 7.5 |
| 44328.177083333336 | 8.37 |
| 44328.1875 | 6.71 |
| 44328.197916666664 | 7.31 |
| 44328.208333333336 | 7.32 |
| 44328.21875 | 8.27 |
| 44328.229166666664 | 8.25 |
| 44328.239583333336 | 7.8 |
| 44328.25 | 7.31 |
| 44328.260416666664 | 7.29 |
| 44328.270833333336 | 7.88 |
| 44328.28125 | 7.75 |
| 44328.291666666664 | 8 |
| 44328.302083333336 | 7.97 |
| 44328.3125 | 8.83 |
| 44328.322916666664 | 9.27 |
| 44328.333333333336 | 8.94 |
| 44328.34375 | 7.4 |
| 44328.354166666664 | 6.73 |
| 44328.364583333336 | 7.06 |
| 44328.375 | 6.55 |
| 44328.385416666664 | 6.1 |
| 44328.395833333336 | 6.21 |
| 44328.40625 | 6.1 |
| 44328.416666666664 | 6.19 |
| 44328.427083333336 | 5.79 |
| 44328.4375 | 5.98 |
| 44328.447916666664 | 5.96 |
| 44328.458333333336 | 5.98 |
| 44328.46875 | 5.87 |
| 44328.479166666664 | 5.69 |
| 44328.489583333336 | 5.71 |
| 44328.5 | 5.24 |
| 44328.510416666664 | 5.2 |
| 44328.520833333336 | 5.34 |
| 44328.53125 | 4.93 |
| 44328.541666666664 | 5.43 |
| 44328.552083333336 | 5.61 |
| 44328.5625 | 5.23 |
| 44328.572916666664 | 5.31 |
| 44328.583333333336 | 5.03 |
| 44328.59375 | 5.06 |
| 44328.604166666664 | 5.16 |
| 44328.614583333336 | 4.81 |
| 44328.625 | 4.86 |
| 44328.635416666664 | 4.78 |
| 44328.645833333336 | 4.67 |
| 44328.65625 | 4.75 |
| 44328.666666666664 | 5.44 |
| 44328.677083333336 | 5.6 |
| 44328.6875 | 5.57 |
| 44328.697916666664 | 6.86 |
| 44328.708333333336 | 7.39 |
| 44328.71875 | 10.03 |
| 44328.729166666664 | 10.91 |
| 44328.739583333336 | 11.87 |
| 44328.75 | 11.3 |
| 44328.760416666664 | 11.88 |
| 44328.770833333336 | 13.94 |
| 44328.78125 | 10.96 |
| 44328.791666666664 | 13.18 |
| 44328.802083333336 | 12.65 |
| 44328.8125 | 10.81 |
| 44328.822916666664 | 11.6 |
| 44328.833333333336 | 9.98 |
| 44328.84375 | 9.41 |
| 44328.854166666664 | 8.89 |
| 44328.864583333336 | 8.04 |
| 44328.875 | 7.76 |
| 44328.885416666664 | 7.44 |
| 44328.895833333336 | 7.08 |
| 44328.90625 | 7.33 |
| 44328.916666666664 | 7.47 |
| 44328.927083333336 | 6.97 |
| 44328.9375 | 7.41 |
| 44328.947916666664 | 8.91 |
| 44328.958333333336 | 6.12 |
| 44328.96875 | 5.94 |
| 44328.979166666664 | 6.91 |
| 44328.989583333336 | 6.34 |
| 44329.0 | 6.41 |
| 44329.010416666664 | 7.1 |
| 44329.020833333336 | 7.24 |
| 44329.03125 | 11.62 |
| 44329.041666666664 | 8.04 |
| 44329.052083333336 | 11.42 |
| 44329.0625 | 9.82 |
| 44329.072916666664 | 13.01 |
| 44329.083333333336 | 7.53 |
| 44329.09375 | 7.12 |
| 44329.104166666664 | 7.16 |
| 44329.114583333336 | 6.22 |
| 44329.125 | 6.82 |
| 44329.135416666664 | 6.98 |
| 44329.145833333336 | 7.41 |
| 44329.15625 | 8.31 |
| 44329.166666666664 | 9.52 |
| 44329.177083333336 | 7.69 |
| 44329.1875 | 10.29 |
| 44329.197916666664 | 8.34 |
| 44329.208333333336 | 8.08 |
| 44329.21875 | 7.78 |
| 44329.229166666664 | 13.17 |
| 44329.239583333336 | 51.72 |
| 44329.25 | 39.54 |
| 44329.260416666664 | 15.24 |
| 44329.270833333336 | 39.87 |
| 44329.28125 | 20.03 |
| 44329.291666666664 | 53.13 |
| 44329.302083333336 | 43.71 |
| 44329.3125 | 13.1 |
| 44329.322916666664 | 22.44 |
| 44329.333333333336 | 15.3 |
| 44329.34375 | 11.86 |
| 44329.354166666664 | 10.58 |
| 44329.364583333336 | 11.1 |
| 44329.375 | 10.81 |
| 44329.385416666664 | 9.22 |
| 44329.395833333336 | 8.94 |
| 44329.40625 | 8.95 |
| 44329.416666666664 | 7.97 |
| 44329.427083333336 | 8.02 |
| 44329.4375 | 7.64 |
| 44329.447916666664 | 6.94 |
| 44329.458333333336 | 7.06 |
| 44329.46875 | 7.21 |
| 44329.479166666664 | 7.12 |
| 44329.489583333336 | 6.3 |
| 44329.5 | 6.16 |
| 44329.510416666664 | 6.54 |
| 44329.520833333336 | 5.95 |
| 44329.53125 | 5.7 |
| 44329.541666666664 | 6.44 |
| 44329.552083333336 | 4.6 |
| 44329.5625 | 6.46 |
| 44329.572916666664 | 6.05 |
| 44329.583333333336 | 26.27 |
| 44329.59375 | 6.88 |
| 44329.604166666664 | 6.84 |
| 44329.614583333336 | 8.83 |
| 44329.625 | 6.38 |
| 44329.635416666664 | 8.68 |
| 44329.645833333336 | 21.22 |
| 44329.65625 | 34.29 |
| 44329.666666666664 | 6.6 |
| 44329.677083333336 | 7.74 |
| 44329.6875 | 8.37 |
| 44329.697916666664 | 6.65 |
| 44329.708333333336 | 18.43 |
| 44329.71875 | 15.34 |
| 44329.729166666664 | 8.1 |
| 44329.739583333336 | 35.63 |
| 44329.75 | 13.47 |
| 44329.760416666664 | 22.78 |
| 44329.770833333336 | 8.12 |
| 44329.78125 | 9.42 |
| 44329.791666666664 | 8.95 |
| 44329.802083333336 | 9.12 |
| 44329.8125 | 20.67 |
| 44329.822916666664 | 53.07 |
| 44329.833333333336 | 8.66 |
| 44329.84375 | 12.27 |
| 44329.854166666664 | 13.92 |
| 44329.864583333336 | 12.01 |
| 44329.875 | 14.03 |
| 44329.885416666664 | 13.11 |
| 44329.895833333336 | 13.02 |
| 44329.90625 | 13.69 |
| 44329.916666666664 | 13.31 |
| 44329.927083333336 | 11.64 |
| 44329.9375 | 11.04 |
| 44329.947916666664 | 11.85 |
| 44329.958333333336 | 11.94 |
| 44329.96875 | 11.9 |
| 44329.979166666664 | 11.44 |
| 44329.989583333336 | 12.79 |
| 44330.0 | 11.88 |
| 44330.010416666664 | 11.52 |
| 44330.020833333336 | 12.34 |
| 44330.03125 | 11.5 |
| 44330.041666666664 | 11.2 |
| 44330.052083333336 | 13.06 |
| 44330.0625 | 11.63 |
| 44330.072916666664 | 9.75 |
| 44330.083333333336 | 10.9 |
| 44330.09375 | 10.19 |
| 44330.104166666664 | 8.96 |
| 44330.114583333336 | 8.64 |
| 44330.125 | 8.13 |
| 44330.135416666664 | 7.4 |
| 44330.145833333336 | 7.79 |
| 44330.15625 | 7.62 |
| 44330.166666666664 | 7.51 |
| 44330.177083333336 | 7.29 |
| 44330.1875 | 6.91 |
| 44330.197916666664 | 7.78 |
| 44330.208333333336 | 7.63 |
| 44330.21875 | 8.45 |
| 44330.229166666664 | 8.35 |
| 44330.239583333336 | 10.25 |
| 44330.25 | 23.73 |
| 44330.260416666664 | 44.22 |
| 44330.270833333336 | 43.02 |
| 44330.28125 | 44.88 |
| 44330.291666666664 | 43.68 |
| 44330.302083333336 | 41.72 |
| 44330.3125 | 17.93 |
| 44330.322916666664 | 23.58 |
| 44330.333333333336 | 88.46 |
| 44330.34375 | 94.02 |
| 44330.354166666664 | 40.79 |
| 44330.364583333336 | 16.74 |
| 44330.375 | 15.8 |
| 44330.385416666664 | 15.91 |
| 44330.395833333336 | 16.95 |
| 44330.40625 | 15.46 |
| 44330.416666666664 | 13.45 |
| 44330.427083333336 | 13.84 |
| 44330.4375 | 11.37 |
| 44330.447916666664 | 11.1 |
| 44330.458333333336 | 10.81 |
| 44330.46875 | 11.12 |
| 44330.479166666664 | 11.22 |
| 44330.489583333336 | 10.54 |
| 44330.5 | 11.23 |
| 44330.510416666664 | 10.61 |
| 44330.520833333336 | 10.19 |
| 44330.53125 | 10.34 |
| 44330.541666666664 | 9.29 |
| 44330.552083333336 | 9.72 |
| 44330.5625 | 9.17 |
| 44330.572916666664 | 9.16 |
| 44330.583333333336 | 8.94 |
| 44330.59375 | 9.02 |
| 44330.604166666664 | 8.47 |
| 44330.614583333336 | 8.25 |
| 44330.625 | 8.58 |
| 44330.635416666664 | 8.87 |
| 44330.645833333336 | 26.93 |
| 44330.65625 | 11.67 |
| 44330.666666666664 | 16.36 |
| 44330.677083333336 | 9.8 |
| 44330.6875 | 40.86 |
| 44330.697916666664 | 13.64 |
| 44330.708333333336 | 10.08 |
| 44330.71875 | 13.93 |
| 44330.729166666664 | 10.95 |
| 44330.739583333336 | 42.78 |
| 44330.75 | 29.09 |
| 44330.760416666664 | 21.01 |
| 44330.770833333336 | 60.12 |
| 44330.78125 | 45.69 |
| 44330.791666666664 | 73.43 |
| 44330.802083333336 | 52.95 |
| 44330.8125 | 23.91 |
| 44330.822916666664 | 41.91 |
| 44330.833333333336 | 79.79 |
| 44330.84375 | 99.02 |
| 44330.854166666664 | 61.34 |
| 44330.864583333336 | 35.95 |
| 44330.875 | 33.12 |
| 44330.885416666664 | 30.15 |
| 44330.895833333336 | 28.73 |
| 44330.90625 | 28.46 |
| 44330.916666666664 | 26.44 |
| 44330.927083333336 | 26.93 |
| 44330.9375 | 23.37 |
| 44330.947916666664 | 25.91 |
| 44330.958333333336 | 24.75 |
| 44330.96875 | 23.85 |
| 44330.979166666664 | 21.53 |
| 44330.989583333336 | 19.87 |
| 44331.0 | 19.26 |
| 44331.010416666664 | 22.97 |
| 44331.020833333336 | 19.88 |
| 44331.03125 | 19.51 |
| 44331.041666666664 | 27.31 |
| 44331.052083333336 | 28.7 |
| 44331.0625 | 21.61 |
| 44331.072916666664 | 25.52 |
| 44331.083333333336 | 19.47 |
| 44331.09375 | 26.2 |
| 44331.104166666664 | 19.09 |
| 44331.114583333336 | 17.88 |
| 44331.125 | 16.25 |
| 44331.135416666664 | 14.91 |
| 44331.145833333336 | 14.06 |
| 44331.15625 | 13.22 |
| 44331.166666666664 | 13.5 |
| 44331.177083333336 | 12.59 |
| 44331.1875 | 14.28 |
| 44331.197916666664 | 12.8 |
| 44331.208333333336 | 14.63 |
| 44331.21875 | 14.48 |
| 44331.229166666664 | 16.68 |
| 44331.239583333336 | 16.67 |
| 44331.25 | 17.55 |
| 44331.260416666664 | 70.35 |
| 44331.270833333336 | 26.1 |
| 44331.28125 | 55.35 |
| 44331.291666666664 | 96.59 |
| 44331.302083333336 | 96.16 |
| 44331.3125 | 101.1 |
| 44331.322916666664 | 100.4 |
| 44331.333333333336 | 111.44 |
| 44331.34375 | 103.08 |
| 44331.354166666664 | 109.36 |
| 44331.364583333336 | 59.07 |
| 44331.375 | 72.61 |
| 44331.385416666664 | 82.38 |
| 44331.395833333336 | 32.2 |
| 44331.40625 | 28.09 |
| 44331.416666666664 | 26.2 |
| 44331.427083333336 | 22.98 |
| 44331.4375 | 21.43 |
| 44331.447916666664 | 20 |
| 44331.458333333336 | 19.61 |
| 44331.46875 | 17.96 |
| 44331.479166666664 | 17.01 |
| 44331.489583333336 | 16.79 |
| 44331.5 | 17.32 |
| 44331.510416666664 | 16.37 |
| 44331.520833333336 | 14.41 |
| 44331.53125 | 15.67 |
| 44331.541666666664 | 16.27 |
| 44331.552083333336 | 15.37 |
| 44331.5625 | 13.41 |
| 44331.572916666664 | 14.51 |
| 44331.583333333336 | 15.02 |
| 44331.59375 | 16.65 |
| 44331.604166666664 | 17.02 |
| 44331.614583333336 | 16.08 |
| 44331.625 | 16.61 |
| 44331.635416666664 | 16.39 |
| 44331.645833333336 | 17.43 |
| 44331.65625 | 16.45 |
| 44331.666666666664 | 16.18 |
| 44331.677083333336 | 23.42 |
| 44331.6875 | 13.86 |
| 44331.697916666664 | 19.45 |
| 44331.708333333336 | 16.08 |
| 44331.71875 | 14.88 |
| 44331.729166666664 | 17.36 |
| 44331.739583333336 | 16.98 |
| 44331.75 | 17.34 |
| 44331.760416666664 | 14 |
| 44331.770833333336 | 11.77 |
| 44331.78125 | 15.34 |
| 44331.791666666664 | 46.8 |
| 44331.802083333336 | 23.71 |
| 44331.8125 | 108.11 |
| 44331.822916666664 | 135.17 |
| 44331.833333333336 | 124.68 |
| 44331.84375 | 140.11 |
| 44331.854166666664 | 156.91 |
| 44331.864583333336 | 126.21 |
| 44331.875 | 153.7 |
| 44331.885416666664 | 88.93 |
| 44331.895833333336 | 93.9 |
| 44331.90625 | 114.15 |
| 44331.916666666664 | 84.03 |
| 44331.927083333336 | 86.12 |
| 44331.9375 | 65.33 |
| 44331.947916666664 | 60.76 |
| 44331.958333333336 | 53.08 |
| 44331.96875 | 46.71 |
| 44331.979166666664 | 40.11 |
| 44331.989583333336 | 49.82 |
| 44332.0 | 35.14 |
| 44332.010416666664 | 32.29 |
| 44332.020833333336 | 36.45 |
| 44332.03125 | 32.9 |
| 44332.041666666664 | 29.13 |
| 44332.052083333336 | 28.04 |
| 44332.0625 | 25.33 |
| 44332.072916666664 | 25.38 |
| 44332.083333333336 | 24.69 |
| 44332.09375 | 23.19 |
| 44332.104166666664 | 23.05 |
| 44332.114583333336 | 22.55 |
| 44332.125 | 21.23 |
| 44332.135416666664 | 25.32 |
| 44332.145833333336 | 24.13 |
| 44332.15625 | 20.9 |
| 44332.166666666664 | 20.61 |
| 44332.177083333336 | 20.02 |
| 44332.1875 | 18.67 |
| 44332.197916666664 | 18.24 |
| 44332.208333333336 | 16.97 |
| 44332.21875 | 20.72 |
| 44332.229166666664 | 47.26 |
| 44332.239583333336 | 67.87 |
| 44332.25 | 63.52 |
| 44332.260416666664 | 33.93 |
| 44332.270833333336 | 68.2 |
| 44332.28125 | 52.48 |
| 44332.291666666664 | 58.25 |
| 44332.302083333336 | 92.08 |
| 44332.3125 | 92.52 |
| 44332.322916666664 | 114.82 |
| 44332.333333333336 | 102.41 |
| 44332.34375 | 98.48 |
| 44332.354166666664 | 100.74 |
| 44332.364583333336 | 101.36 |
| 44332.375 | 104.6 |
| 44332.385416666664 | 108.53 |
| 44332.395833333336 | 93.34 |
| 44332.40625 | 78.15 |
| 44332.416666666664 | 56.01 |
| 44332.427083333336 | 54.3 |
| 44332.4375 | 31.54 |
| 44332.447916666664 | 39.24 |
| 44332.458333333336 | 25.61 |
| 44332.46875 | 27.53 |
| 44332.479166666664 | 25.07 |
| 44332.489583333336 | 22.59 |
| 44332.5 | 23.21 |
| 44332.510416666664 | 22.82 |
| 44332.520833333336 | 20.87 |
| 44332.53125 | 20.29 |
| 44332.541666666664 | 19.51 |
| 44332.552083333336 | 20.48 |
| 44332.5625 | 28.99 |
| 44332.572916666664 | 18.15 |
| 44332.583333333336 | 21.84 |
| 44332.59375 | 29.23 |
| 44332.604166666664 | 24.36 |
| 44332.614583333336 | 23 |
| 44332.625 | 22.83 |
| 44332.635416666664 | 19.2 |
| 44332.645833333336 | 21.35 |
| 44332.65625 | 21.79 |
| 44332.666666666664 | 42.33 |
| 44332.677083333336 | 41.69 |
| 44332.6875 | 21.89 |
| 44332.697916666664 | 30.11 |
| 44332.708333333336 | 20.08 |
| 44332.71875 | 23.68 |
| 44332.729166666664 | 26.4 |
| 44332.739583333336 | 21.56 |
| 44332.75 | 16.81 |
| 44332.760416666664 | 20.3 |
| 44332.770833333336 | 24.45 |
| 44332.78125 | 15.61 |
| 44332.791666666664 | 22.07 |
| 44332.802083333336 | 40.43 |
| 44332.8125 | 50.66 |
| 44332.822916666664 | 68.23 |
| 44332.833333333336 | 126.46 |
| 44332.84375 | 105.33 |
| 44332.854166666664 | 144.58 |
| 44332.864583333336 | 105.59 |
| 44332.875 | 137.19 |
| 44332.885416666664 | 162.3 |
| 44332.895833333336 | 159.2 |
| 44332.90625 | 104.97 |
| 44332.916666666664 | 99.13 |
| 44332.927083333336 | 41.23 |
| 44332.9375 | 82.47 |
| 44332.947916666664 | 82.43 |
| 44332.958333333336 | 52.67 |
| 44332.96875 | 59.78 |
| 44332.979166666664 | 73.46 |
| 44332.989583333336 | 67.74 |
| 44333.0 | 54.03 |
| 44333.010416666664 | 52.65 |
| 44333.020833333336 | 37.72 |
| 44333.03125 | 38.02 |
| 44333.041666666664 | 31.49 |
| 44333.052083333336 | 25.85 |
| 44333.0625 | 25.13 |
| 44333.072916666664 | 33.76 |
| 44333.083333333336 | 25.92 |
| 44333.09375 | 22.36 |
| 44333.104166666664 | 24.51 |
| 44333.114583333336 | 26.91 |
| 44333.125 | 22.37 |
| 44333.135416666664 | 32.82 |
| 44333.145833333336 | 25.85 |
| 44333.15625 | 28.83 |
| 44333.166666666664 | 23.96 |
| 44333.177083333336 | 25.86 |
| 44333.1875 | 22.48 |
| 44333.197916666664 | 19.54 |
| 44333.208333333336 | 21.29 |
| 44333.21875 | 16.19 |
| 44333.229166666664 | 17.22 |
| 44333.239583333336 | 16.52 |
| 44333.25 | 24.88 |
| 44333.260416666664 | 36.5 |
| 44333.270833333336 | 27.17 |
| 44333.28125 | 32 |
| 44333.291666666664 | 23.57 |
| 44333.302083333336 | 18.27 |
| 44333.3125 | 23.24 |
| 44333.322916666664 | 25.76 |
| 44333.333333333336 | 30.2 |
| 44333.34375 | 50.47 |
| 44333.354166666664 | 48.38 |
| 44333.364583333336 | 47.09 |
| 44333.375 | 38.51 |
| 44333.385416666664 | 34.04 |
| 44333.395833333336 | 37.64 |
| 44333.40625 | 47.68 |
| 44333.416666666664 | 42.76 |
| 44333.427083333336 | 32.25 |
| 44333.4375 | 50.56 |
| 44333.447916666664 | 49.74 |
| 44333.458333333336 | 62.17 |
| 44333.46875 | 39.42 |
| 44333.479166666664 | 40.17 |
| 44333.489583333336 | 45.53 |
| 44333.5 | 51.53 |
| 44333.510416666664 | 27.63 |
| 44333.520833333336 | 28.12 |
| 44333.53125 | 23.9 |
| 44333.541666666664 | 25.71 |
| 44333.552083333336 | 21.06 |
| 44333.5625 | 16.73 |
| 44333.572916666664 | 16.48 |
| 44333.583333333336 | 11.83 |
| 44333.59375 | 13.76 |
| 44333.604166666664 | 14.49 |
| 44333.614583333336 | 16.43 |
| 44333.625 | 13.63 |
| 44333.635416666664 | 24.61 |
| 44333.645833333336 | 17 |
| 44333.65625 | 16.95 |
| 44333.666666666664 | 20.81 |
| 44333.677083333336 | 20.75 |
| 44333.6875 | 16.73 |
| 44333.697916666664 | 13.84 |
| 44333.708333333336 | 14.33 |
| 44333.71875 | 13.12 |
| 44333.729166666664 | 18.45 |
| 44333.739583333336 | 17.07 |
| 44333.75 | 14.08 |
| 44333.760416666664 | 15.72 |
| 44333.770833333336 | 14.6 |
| 44333.78125 | 12.45 |
| 44333.791666666664 | 8.14 |
| 44333.802083333336 | 11.93 |
| 44333.8125 | 10.08 |
| 44333.822916666664 | 13.59 |
| 44333.833333333336 | 16.19 |
| 44333.84375 | 15.76 |
| 44333.854166666664 | 25.48 |
| 44333.864583333336 | 45.5 |
| 44333.875 | 67.3 |
| 44333.885416666664 | 68.4 |
| 44333.895833333336 | 59.16 |
| 44333.90625 | 74.66 |
| 44333.916666666664 | 73.87 |
| 44333.927083333336 | 65.88 |
| 44333.9375 | 39.66 |
| 44333.947916666664 | 68.52 |
| 44333.958333333336 | 27.85 |
| 44333.96875 | 26.35 |
| 44333.979166666664 | 25.39 |
| 44333.989583333336 | 34.63 |
| 44334.0 | 51.43 |
| 44334.010416666664 | 40.87 |
| 44334.020833333336 | 38.36 |
| 44334.03125 | 26.32 |
| 44334.041666666664 | 35.05 |
| 44334.052083333336 | 24.36 |
| 44334.0625 | 32.33 |
| 44334.072916666664 | 40.03 |
| 44334.083333333336 | 27.82 |
| 44334.09375 | 32.62 |
| 44334.104166666664 | 43.07 |
| 44334.114583333336 | 51.58 |
| 44334.125 | 29.59 |
| 44334.135416666664 | 31.01 |
| 44334.145833333336 | 29.21 |
| 44334.15625 | 18.74 |
| 44334.166666666664 | 19.71 |
| 44334.177083333336 | 19.08 |
| 44334.1875 | 21.21 |
| 44334.197916666664 | 19.37 |
| 44334.208333333336 | 16.61 |
| 44334.21875 | 13.59 |
| 44334.229166666664 | 12.4 |
| 44334.239583333336 | 14 |
| 44334.25 | 13.81 |
| 44334.260416666664 | 17.74 |
| 44334.270833333336 | 14.53 |
| 44334.28125 | 13.16 |
| 44334.291666666664 | 15.97 |
| 44334.302083333336 | 33.11 |
| 44334.3125 | 12.3 |
| 44334.322916666664 | 12.37 |
| 44334.333333333336 | 17.68 |
| 44334.34375 | 16.21 |
| 44334.354166666664 | 23.83 |
| 44334.364583333336 | 15.82 |
| 44334.375 | 15.88 |
| 44334.385416666664 | 17.76 |
| 44334.395833333336 | 27.94 |
| 44334.40625 | 28.34 |
| 44334.416666666664 | 30.81 |
| 44334.427083333336 | 41.89 |
| 44334.4375 | 25.61 |
| 44334.447916666664 | 41.63 |
| 44334.458333333336 | 40.64 |
| 44334.46875 | 38.01 |
| 44334.479166666664 | 35.23 |
| 44334.489583333336 | 16.66 |
| 44334.5 | 21.03 |
| 44334.510416666664 | 18.97 |
| 44334.520833333336 | 12.93 |
| 44334.53125 | 21.01 |
| 44334.541666666664 | 30.94 |
| 44334.552083333336 | 2.38 |
| 44334.5625 | 2.24 |
| 44334.572916666664 | 2.18 |
| 44334.583333333336 | 2.12 |
| 44334.59375 | 1.98 |
| 44334.604166666664 | 1.82 |
| 44334.614583333336 | 1.98 |
| 44334.625 | 1.83 |
| 44334.635416666664 | 1.76 |
| 44334.645833333336 | 1.87 |
| 44334.65625 | 1.86 |
| 44334.666666666664 | 1.74 |
| 44334.677083333336 | 1.73 |
| 44334.6875 | 1.65 |
| 44334.697916666664 | 1.56 |
| 44334.708333333336 | 2.09 |
| 44334.71875 | 2.05 |
| 44334.729166666664 | 2.37 |
| 44334.739583333336 | 2.94 |
| 44334.75 | 2.03 |
| 44334.760416666664 | 2.37 |
| 44334.770833333336 | 2.14 |
| 44334.78125 | 1.63 |
| 44334.791666666664 | 1.8 |
| 44334.802083333336 | 2.03 |
| 44334.8125 | 1.98 |
| 44334.822916666664 | 2.24 |
| 44334.833333333336 | 2.35 |
| 44334.84375 | 2.23 |
| 44334.854166666664 | 2.28 |
| 44334.864583333336 | 3 |
| 44334.875 | 3.12 |
| 44334.885416666664 | 3.27 |
| 44334.895833333336 | 3.24 |
| 44334.90625 | 3.55 |
| 44334.916666666664 | 3.44 |
| 44334.927083333336 | 3.62 |
| 44334.9375 | 3.65 |
| 44334.947916666664 | 3.63 |
| 44334.958333333336 | 3.71 |
| 44334.96875 | 3.57 |
| 44334.979166666664 | 3.52 |
| 44334.989583333336 | 3.84 |
| 44335.0 | 4.49 |
| 44335.010416666664 | 4.81 |
| 44335.020833333336 | 4.66 |
| 44335.03125 | 5.19 |
| 44335.041666666664 | 4.49 |
| 44335.052083333336 | 3.6 |
| 44335.0625 | 3.56 |
| 44335.072916666664 | 3.35 |
| 44335.083333333336 | 3.81 |
| 44335.09375 | 4.08 |
| 44335.104166666664 | 4.14 |
| 44335.114583333336 | 4.49 |
| 44335.125 | 4.15 |
| 44335.135416666664 | 4.15 |
| 44335.145833333336 | 3.75 |
| 44335.15625 | 3.83 |
| 44335.166666666664 | 4.02 |
| 44335.177083333336 | 3.93 |
| 44335.1875 | 3.26 |
| 44335.197916666664 | 3.28 |
| 44335.208333333336 | 3.21 |
| 44335.21875 | 3.54 |
| 44335.229166666664 | 3.11 |
| 44335.239583333336 | 3.52 |
| 44335.25 | 3.24 |
| 44335.260416666664 | 3.28 |
| 44335.270833333336 | 2.89 |
| 44335.28125 | 2.78 |
| 44335.291666666664 | 3.02 |
| 44335.302083333336 | 2.88 |
| 44335.3125 | 2.42 |
| 44335.322916666664 | 2.09 |
| 44335.333333333336 | 2.28 |
| 44335.34375 | 2.54 |
| 44335.354166666664 | 2.26 |
| 44335.364583333336 | 2.82 |
| 44335.375 | 2.56 |
| 44335.385416666664 | 2.48 |
| 44335.395833333336 | 3.1 |
| 44335.40625 | 3.25 |
| 44335.416666666664 | 2.78 |
| 44335.427083333336 | 2.68 |
| 44335.4375 | 2.74 |
| 44335.447916666664 | 2.84 |
| 44335.458333333336 | 2.89 |
| 44335.46875 | 3.14 |
| 44335.479166666664 | 3.17 |
| 44335.489583333336 | 3.82 |
| 44335.5 | 3.18 |
| 44335.510416666664 | 3.49 |
| 44335.520833333336 | 3.86 |
| 44335.53125 | 3.88 |
| 44335.541666666664 | 3.61 |
| 44335.552083333336 | 4.39 |
| 44335.5625 | 3.89 |
| 44335.572916666664 | 3.22 |
| 44335.583333333336 | 3.11 |
| 44335.59375 | 2.9 |
| 44335.604166666664 | 2.72 |
| 44335.614583333336 | 2.98 |
| 44335.625 | 2.65 |
| 44335.635416666664 | 2.92 |
| 44335.645833333336 | 2.94 |
| 44335.65625 | 2.75 |
| 44335.666666666664 | 2.33 |
| 44335.677083333336 | 2.42 |
| 44335.6875 | 2.28 |
| 44335.697916666664 | 2.13 |
| 44335.708333333336 | 2.09 |
| 44335.71875 | 2.18 |
| 44335.729166666664 | 1.96 |
| 44335.739583333336 | 2.09 |
| 44335.75 | 2.16 |
| 44335.760416666664 | 2.51 |
| 44335.770833333336 | 2.42 |
| 44335.78125 | 2.47 |
| 44335.791666666664 | 2.35 |
| 44335.802083333336 | 3.16 |
| 44335.8125 | 2.86 |
| 44335.822916666664 | 2.86 |
| 44335.833333333336 | 2.44 |
| 44335.84375 | 3.12 |
| 44335.854166666664 | 3.66 |
| 44335.864583333336 | 3.52 |
| 44335.875 | 3.46 |
| 44335.885416666664 | 3.35 |
| 44335.895833333336 | 3.19 |
| 44335.90625 | 3.39 |
| 44335.916666666664 | 3.41 |
| 44335.927083333336 | 3.94 |
| 44335.9375 | 4.01 |
| 44335.947916666664 | 4.43 |
| 44335.958333333336 | 4.44 |
| 44335.96875 | 4.75 |
| 44335.979166666664 | 4.85 |
| 44335.989583333336 | 4.98 |
| 44336.0 | 5.07 |
| 44336.010416666664 | 5.12 |
| 44336.020833333336 | 5.64 |
| 44336.03125 | 6.52 |
| 44336.041666666664 | 7.11 |
| 44336.052083333336 | 7.26 |
| 44336.0625 | 6.31 |
| 44336.072916666664 | 5.81 |
| 44336.083333333336 | 5.29 |
| 44336.09375 | 5.11 |
| 44336.104166666664 | 4.68 |
| 44336.114583333336 | 4.7 |
| 44336.125 | 4.4 |
| 44336.135416666664 | 4.37 |
| 44336.145833333336 | 4.52 |
| 44336.15625 | 4.04 |
| 44336.166666666664 | 3.44 |
| 44336.177083333336 | 3.43 |
| 44336.1875 | 3.64 |
| 44336.197916666664 | 3.35 |
| 44336.208333333336 | 3.4 |
| 44336.21875 | 3.47 |
| 44336.229166666664 | 3.22 |
| 44336.239583333336 | 3.16 |
| 44336.25 | 3.44 |
| 44336.260416666664 | 3.38 |
| 44336.270833333336 | 3.52 |
| 44336.28125 | 3.45 |
| 44336.291666666664 | 3.52 |
| 44336.302083333336 | 3.49 |
| 44336.3125 | 3.52 |
| 44336.322916666664 | 3.22 |
| 44336.333333333336 | 2.62 |
| 44336.34375 | 2.51 |
| 44336.354166666664 | 2.65 |
| 44336.364583333336 | 2.48 |
| 44336.375 | 2.34 |
| 44336.385416666664 | 2.31 |
| 44336.395833333336 | 2.34 |
| 44336.40625 | 2.41 |
| 44336.416666666664 | 2.39 |
| 44336.427083333336 | 2.36 |
| 44336.4375 | 2.41 |
| 44336.447916666664 | 2.67 |
| 44336.458333333336 | 2.76 |
| 44336.46875 | 2.92 |
| 44336.479166666664 | 3.02 |
| 44336.489583333336 | 3.1 |
| 44336.5 | 3.22 |
| 44336.510416666664 | 3.34 |
| 44336.520833333336 | 3.28 |
| 44336.53125 | 3.47 |
| 44336.541666666664 | 3.44 |
| 44336.552083333336 | 3.68 |
| 44336.5625 | 4.46 |
| 44336.572916666664 | 4.09 |
| 44336.583333333336 | 4.4 |
| 44336.59375 | 4.34 |
| 44336.604166666664 | 4.03 |
| 44336.614583333336 | 3.61 |
| 44336.625 | 3.27 |
| 44336.635416666664 | 3.16 |
| 44336.645833333336 | 2.95 |
| 44336.65625 | 2.76 |
| 44336.666666666664 | 3 |
| 44336.677083333336 | 2.74 |
| 44336.6875 | 2.97 |
| 44336.697916666664 | 2.81 |
| 44336.708333333336 | 3.08 |
| 44336.71875 | 2.84 |
| 44336.729166666664 | 3.02 |
| 44336.739583333336 | 2.96 |
| 44336.75 | 2.98 |
| 44336.760416666664 | 3.44 |
| 44336.770833333336 | 3.48 |
| 44336.78125 | 3.64 |
| 44336.791666666664 | 3.73 |
| 44336.802083333336 | 3.82 |
| 44336.8125 | 4 |
| 44336.822916666664 | 3.92 |
| 44336.833333333336 | 3.97 |
| 44336.84375 | 4.27 |
| 44336.854166666664 | 4.73 |
| 44336.864583333336 | 4.28 |
| 44336.875 | 4.03 |
| 44336.885416666664 | 3.93 |
| 44336.895833333336 | 4.26 |
| 44336.90625 | 3.81 |
| 44336.916666666664 | 3.77 |
| 44336.927083333336 | 3.62 |
| 44336.9375 | 3.67 |
| 44336.947916666664 | 3.76 |
| 44336.958333333336 | 4.56 |
| 44336.96875 | 4.66 |
| 44336.979166666664 | 4.82 |
| 44336.989583333336 | 4.97 |
| 44337.0 | 5.08 |
| 44337.010416666664 | 5.51 |
| 44337.020833333336 | 5.91 |
| 44337.03125 | 6.07 |
| 44337.041666666664 | 6.56 |
| 44337.052083333336 | 6.66 |
| 44337.0625 | 6.64 |
| 44337.072916666664 | 6.9 |
| 44337.083333333336 | 6.74 |
| 44337.09375 | 7.3 |
| 44337.104166666664 | 7.51 |
| 44337.114583333336 | 7.16 |
| 44337.125 | 6.97 |
| 44337.135416666664 | 6.52 |
| 44337.145833333336 | 6.21 |
| 44337.15625 | 5.67 |
| 44337.166666666664 | 5.64 |
| 44337.177083333336 | 5.28 |
| 44337.1875 | 5.14 |
| 44337.197916666664 | 4.79 |
| 44337.208333333336 | 4.47 |
| 44337.21875 | 4.31 |
| 44337.229166666664 | 4.67 |
| 44337.239583333336 | 4.62 |
| 44337.25 | 4.94 |
| 44337.260416666664 | 4.52 |
| 44337.270833333336 | 4.59 |
| 44337.28125 | 4.78 |
| 44337.291666666664 | 4.54 |
| 44337.302083333336 | 4.63 |
| 44337.3125 | 4.35 |
| 44337.322916666664 | 3.96 |
| 44337.333333333336 | 3.96 |
| 44337.34375 | 3.78 |
| 44337.354166666664 | 3.74 |
| 44337.364583333336 | 3.36 |
| 44337.375 | 3.97 |
| 44337.385416666664 | 4.09 |
| 44337.395833333336 | 3.17 |
| 44337.40625 | 3 |
| 44337.416666666664 | 2.66 |
| 44337.427083333336 | 2.7 |
| 44337.4375 | 2.41 |
| 44337.447916666664 | 2.62 |
| 44337.458333333336 | 2.58 |
| 44337.46875 | 3.11 |
| 44337.479166666664 | 2.97 |
| 44337.489583333336 | 3.41 |
| 44337.5 | 3.9 |
| 44337.510416666664 | 4.11 |
| 44337.520833333336 | 4.32 |
| 44337.53125 | 4.04 |
| 44337.541666666664 | 3.97 |
| 44337.552083333336 | 4.06 |
| 44337.5625 | 4.17 |
| 44337.572916666664 | 4.16 |
| 44337.583333333336 | 4.55 |
| 44337.59375 | 4.75 |
| 44337.604166666664 | 5.09 |
| 44337.614583333336 | 4.94 |
| 44337.625 | 5.36 |
| 44337.635416666664 | 5.63 |
| 44337.645833333336 | 5.26 |
| 44337.65625 | 4.21 |
| 44337.666666666664 | 4.46 |
| 44337.677083333336 | 3.94 |
| 44337.6875 | 4.15 |
| 44337.697916666664 | 3.65 |
| 44337.708333333336 | 3.76 |
| 44337.71875 | 3.87 |
| 44337.729166666664 | 3.49 |
| 44337.739583333336 | 3.33 |
| 44337.75 | 3.51 |
| 44337.760416666664 | 3.47 |
| 44337.770833333336 | 3.41 |
| 44337.78125 | 3.23 |
| 44337.791666666664 | 3.14 |
| 44337.802083333336 | 3.51 |
| 44337.8125 | 3.73 |
| 44337.822916666664 | 3.64 |
| 44337.833333333336 | 3.97 |
| 44337.84375 | 4.13 |
| 44337.854166666664 | 4.49 |
| 44337.864583333336 | 4.43 |
| 44337.875 | 4.47 |
| 44337.885416666664 | 4.69 |
| 44337.895833333336 | 5.87 |
| 44337.90625 | 4.33 |
| 44337.916666666664 | 3.78 |
| 44337.927083333336 | 3.87 |
| 44337.9375 | 4.06 |
| 44337.947916666664 | 3.89 |
| 44337.958333333336 | 3.86 |
| 44337.96875 | 3.85 |
| 44337.979166666664 | 4.07 |
| 44337.989583333336 | 4.02 |
| 44338.0 | 4.12 |
| 44338.010416666664 | 5.2 |
| 44338.020833333336 | 6.3 |
| 44338.03125 | 6.47 |
| 44338.041666666664 | 6.68 |
| 44338.052083333336 | 6.41 |
| 44338.0625 | 7.19 |
| 44338.072916666664 | 7.49 |
| 44338.083333333336 | 7.52 |
| 44338.09375 | 8.41 |
| 44338.104166666664 | 8.54 |
| 44338.114583333336 | 8.57 |
| 44338.125 | 9.3 |
| 44338.135416666664 | 11.22 |
| 44338.145833333336 | 10.45 |
| 44338.15625 | 8.21 |
| 44338.166666666664 | 10.03 |
| 44338.177083333336 | 9.2 |
| 44338.1875 | 7 |
| 44338.197916666664 | 7.33 |
| 44338.208333333336 | 6.89 |
| 44338.21875 | 6.4 |
| 44338.229166666664 | 5.8 |
| 44338.239583333336 | 5.19 |
| 44338.25 | 5.14 |
| 44338.260416666664 | 4.29 |
| 44338.270833333336 | 4.22 |
| 44338.28125 | 4.12 |
| 44338.291666666664 | 4.27 |
| 44338.302083333336 | 3.46 |
| 44338.3125 | 3.84 |
| 44338.322916666664 | 3.47 |
| 44338.333333333336 | 3.38 |
| 44338.34375 | 3.75 |
| 44338.354166666664 | 3.46 |
| 44338.364583333336 | 3.59 |
| 44338.375 | 3.44 |
| 44338.385416666664 | 3.52 |
| 44338.395833333336 | 3.44 |
| 44338.40625 | 5.44 |
| 44338.416666666664 | 3.39 |
| 44338.427083333336 | 3.39 |
| 44338.4375 | 2.47 |
| 44338.447916666664 | 2.37 |
| 44338.458333333336 | 2.37 |
| 44338.46875 | 2.58 |
| 44338.479166666664 | 2.65 |
| 44338.489583333336 | 2.6 |
| 44338.5 | 2.86 |
| 44338.510416666664 | 3.19 |
| 44338.520833333336 | 3.31 |
| 44338.53125 | 3.73 |
| 44338.541666666664 | 3.78 |
| 44338.552083333336 | 4.5 |
| 44338.5625 | 4.44 |
| 44338.572916666664 | 4.62 |
| 44338.583333333336 | 5.09 |
| 44338.59375 | 5.23 |
| 44338.604166666664 | 5.79 |
| 44338.614583333336 | 5.65 |
| 44338.625 | 6.3 |
| 44338.635416666664 | 6.42 |
| 44338.645833333336 | 7.03 |
| 44338.65625 | 8.08 |
| 44338.666666666664 | 7.32 |
| 44338.677083333336 | 7.03 |
| 44338.6875 | 6.1 |
| 44338.697916666664 | 6.06 |
| 44338.708333333336 | 5.54 |
| 44338.71875 | 5.08 |
| 44338.729166666664 | 5.3 |
| 44338.739583333336 | 4.82 |
| 44338.75 | 4.35 |
| 44338.760416666664 | 3.95 |
| 44338.770833333336 | 3.84 |
| 44338.78125 | 3.29 |
| 44338.791666666664 | 3.08 |
| 44338.802083333336 | 2.93 |
| 44338.8125 | 3.13 |
| 44338.822916666664 | 3.5 |
| 44338.833333333336 | 3.69 |
| 44338.84375 | 3.77 |
| 44338.854166666664 | 3.87 |
| 44338.864583333336 | 3.71 |
| 44338.875 | 3.58 |
| 44338.885416666664 | 3.79 |
| 44338.895833333336 | 3.7 |
| 44338.90625 | 3.82 |
| 44338.916666666664 | 3.6 |
| 44338.927083333336 | 3.91 |
| 44338.9375 | 4 |
| 44338.947916666664 | 4.12 |
| 44338.958333333336 | 4.32 |
| 44338.96875 | 4.25 |
| 44338.979166666664 | 4.66 |
| 44338.989583333336 | 4.59 |
| 44339.0 | 4.74 |
| 44339.010416666664 | 5.19 |
| 44339.020833333336 | 4.83 |
| 44339.03125 | 5.1 |
| 44339.041666666664 | 5.3 |
| 44339.052083333336 | 4.71 |
| 44339.0625 | 5.06 |
| 44339.072916666664 | 5.6 |
| 44339.083333333336 | 5.91 |
| 44339.09375 | 7.02 |
| 44339.104166666664 | 7.47 |
| 44339.114583333336 | 7.7 |
| 44339.125 | 7.86 |
| 44339.135416666664 | 8.26 |
| 44339.145833333336 | 8.29 |
| 44339.15625 | 8.81 |
| 44339.166666666664 | 9.57 |
| 44339.177083333336 | 11.16 |
| 44339.1875 | 9.96 |
| 44339.197916666664 | 8.41 |
| 44339.208333333336 | 9.26 |
| 44339.21875 | 7.93 |
| 44339.229166666664 | 7.64 |
| 44339.239583333336 | 7.14 |
| 44339.25 | 6.39 |
| 44339.260416666664 | 6.09 |
| 44339.270833333336 | 6.01 |
| 44339.28125 | 4.96 |
| 44339.291666666664 | 4.85 |
| 44339.302083333336 | 4.25 |
| 44339.3125 | 4.24 |
| 44339.322916666664 | 3.48 |
| 44339.333333333336 | 3.31 |
| 44339.34375 | 3.78 |
| 44339.354166666664 | 3.47 |
| 44339.364583333336 | 3.34 |
| 44339.375 | 3.43 |
| 44339.385416666664 | 3.3 |
| 44339.395833333336 | 3.96 |
| 44339.40625 | 3.84 |
| 44339.416666666664 | 3.84 |
| 44339.427083333336 | 3.42 |
| 44339.4375 | 3.08 |
| 44339.447916666664 | 2.54 |
| 44339.458333333336 | 2.92 |
| 44339.46875 | 2.52 |
| 44339.479166666664 | 2.43 |
| 44339.489583333336 | 2.45 |
| 44339.5 | 2.41 |
| 44339.510416666664 | 2.15 |
| 44339.520833333336 | 2.39 |
| 44339.53125 | 2.37 |
| 44339.541666666664 | 2.13 |
| 44339.552083333336 | 2.31 |
| 44339.5625 | 2.65 |
| 44339.572916666664 | 2.98 |
| 44339.583333333336 | 2.66 |
| 44339.59375 | 2.94 |
| 44339.604166666664 | 3.81 |
| 44339.614583333336 | 3.94 |
| 44339.625 | 4.63 |
| 44339.635416666664 | 5.3 |
| 44339.645833333336 | 5.33 |
| 44339.65625 | 5.94 |
| 44339.666666666664 | 6.44 |
| 44339.677083333336 | 7.1 |
| 44339.6875 | 7.92 |
| 44339.697916666664 | 6.12 |
| 44339.708333333336 | 6.84 |
| 44339.71875 | 7.12 |
| 44339.729166666664 | 5.78 |
| 44339.739583333336 | 6.27 |
| 44339.75 | 5.78 |
| 44339.760416666664 | 5.23 |
| 44339.770833333336 | 5.38 |
| 44339.78125 | 4.88 |
| 44339.791666666664 | 4.44 |
| 44339.802083333336 | 4.03 |
| 44339.8125 | 3.73 |
| 44339.822916666664 | 3.49 |
| 44339.833333333336 | 3.86 |
| 44339.84375 | 4.03 |
| 44339.854166666664 | 4.07 |
| 44339.864583333336 | 4.09 |
| 44339.875 | 4.17 |
| 44339.885416666664 | 4.21 |
| 44339.895833333336 | 4.26 |
| 44339.90625 | 4.33 |
| 44339.916666666664 | 4.42 |
| 44339.927083333336 | 4.7 |
| 44339.9375 | 5.14 |
| 44339.947916666664 | 5.6 |
| 44339.958333333336 | 5.71 |
| 44339.96875 | 5.29 |
| 44339.979166666664 | 5.97 |
| 44339.989583333336 | 5.24 |
| 44340.0 | 5.56 |
| 44340.010416666664 | 5.46 |
| 44340.020833333336 | 5.58 |
| 44340.03125 | 6.68 |
| 44340.041666666664 | 5.71 |
| 44340.052083333336 | 5.8 |
| 44340.0625 | 5.36 |
| 44340.072916666664 | 5.56 |
| 44340.083333333336 | 5.47 |
| 44340.09375 | 5.74 |
| 44340.104166666664 | 5.43 |
| 44340.114583333336 | 5.55 |
| 44340.125 | 6.32 |
| 44340.135416666664 | 6.45 |
| 44340.145833333336 | 6.17 |
| 44340.15625 | 7.74 |
| 44340.166666666664 | 8.04 |
| 44340.177083333336 | 8.47 |
| 44340.1875 | 8.43 |
| 44340.197916666664 | 9.04 |
| 44340.208333333336 | 8.97 |
| 44340.21875 | 9.56 |
| 44340.229166666664 | 11.28 |
| 44340.239583333336 | 9.03 |
| 44340.25 | 8.13 |
| 44340.260416666664 | 8.47 |
| 44340.270833333336 | 7.79 |
| 44340.28125 | 7.23 |
| 44340.291666666664 | 6.54 |
| 44340.302083333336 | 6.42 |
| 44340.3125 | 5.95 |
| 44340.322916666664 | 5.25 |
| 44340.333333333336 | 5.12 |
| 44340.34375 | 5.01 |
| 44340.354166666664 | 4.45 |
| 44340.364583333336 | 4.47 |
| 44340.375 | 4.27 |
| 44340.385416666664 | 4.15 |
| 44340.395833333336 | 4.12 |
| 44340.40625 | 4.31 |
| 44340.416666666664 | 3.61 |
| 44340.427083333336 | 3.39 |
| 44340.4375 | 3.18 |
| 44340.447916666664 | 3.12 |
| 44340.458333333336 | 2.89 |
| 44340.46875 | 3.03 |
| 44340.479166666664 | 2.89 |
| 44340.489583333336 | 2.8 |
| 44340.5 | 2.94 |
| 44340.510416666664 | 2.78 |
| 44340.520833333336 | 2.9 |
| 44340.53125 | 3.06 |
| 44340.541666666664 | 3.14 |
| 44340.552083333336 | 3.25 |
| 44340.5625 | 3.21 |
| 44340.572916666664 | 3.27 |
| 44340.583333333336 | 3.27 |
| 44340.59375 | 3.35 |
| 44340.604166666664 | 4.03 |
| 44340.614583333336 | 3.7 |
| 44340.625 | 3.98 |
| 44340.635416666664 | 4.25 |
| 44340.645833333336 | 4.94 |
| 44340.65625 | 5.19 |
| 44340.666666666664 | 5.48 |
| 44340.677083333336 | 5.52 |
| 44340.6875 | 5.75 |
| 44340.697916666664 | 7.21 |
| 44340.708333333336 | 8.26 |
| 44340.71875 | 8.74 |
| 44340.729166666664 | 9.2 |
| 44340.739583333336 | 9.67 |
| 44340.75 | 10.07 |
| 44340.760416666664 | 8.02 |
| 44340.770833333336 | 8.53 |
| 44340.78125 | 8.73 |
| 44340.791666666664 | 8.53 |
| 44340.802083333336 | 8.21 |
| 44340.8125 | 7.77 |
| 44340.822916666664 | 7.39 |
| 44340.833333333336 | 7.29 |
| 44340.84375 | 6.84 |
| 44340.854166666664 | 6.62 |
| 44340.864583333336 | 6.2 |
| 44340.875 | 6.06 |
| 44340.885416666664 | 5.87 |
| 44340.895833333336 | 5.82 |
| 44340.90625 | 5.55 |
| 44340.916666666664 | 5.37 |
| 44340.927083333336 | 4.83 |
| 44340.9375 | 4.81 |
| 44340.947916666664 | 4.47 |
| 44340.958333333336 | 4.61 |
| 44340.96875 | 4.19 |
| 44340.979166666664 | 4.34 |
| 44340.989583333336 | 4.12 |
| 44341.0 | 4.57 |
| 44341.010416666664 | 4.6 |
| 44341.020833333336 | 4.78 |
| 44341.03125 | 4.93 |
| 44341.041666666664 | 4.66 |
| 44341.052083333336 | 4.67 |
| 44341.0625 | 5.03 |
| 44341.072916666664 | 4.86 |
| 44341.083333333336 | 4.96 |
| 44341.09375 | 4.9 |
| 44341.104166666664 | 5.13 |
| 44341.114583333336 | 5.19 |
| 44341.125 | 4.86 |
| 44341.135416666664 | 4.79 |
| 44341.145833333336 | 5.01 |
| 44341.15625 | 4.97 |
| 44341.166666666664 | 4.9 |
| 44341.177083333336 | 5.31 |
| 44341.1875 | 5.92 |
| 44341.197916666664 | 5.71 |
| 44341.208333333336 | 5.86 |
| 44341.21875 | 5.66 |
| 44341.229166666664 | 6.07 |
| 44341.239583333336 | 6.35 |
| 44341.25 | 6.23 |
| 44341.260416666664 | 6.07 |
| 44341.270833333336 | 6 |
| 44341.28125 | 5.98 |
| 44341.291666666664 | 6.07 |
| 44341.302083333336 | 5.72 |
| 44341.3125 | 5.89 |
| 44341.322916666664 | 5.9 |
| 44341.333333333336 | 5.46 |
| 44341.34375 | 5.21 |
| 44341.354166666664 | 4.92 |
| 44341.364583333336 | 4.6 |
| 44341.375 | 4.64 |
| 44341.385416666664 | 4.71 |
| 44341.395833333336 | 4.59 |
| 44341.40625 | 4.26 |
| 44341.416666666664 | 4.15 |
| 44341.427083333336 | 4.01 |
| 44341.4375 | 3.67 |
| 44341.447916666664 | 3.79 |
| 44341.458333333336 | 3.45 |
| 44341.46875 | 3.33 |
| 44341.479166666664 | 2.92 |
| 44341.489583333336 | 2.88 |
| 44341.5 | 2.82 |
| 44341.510416666664 | 2.83 |
| 44341.520833333336 | 2.65 |
| 44341.53125 | 2.9 |
| 44341.541666666664 | 2.73 |
| 44341.552083333336 | 2.77 |
| 44341.5625 | 2.96 |
| 44341.572916666664 | 2.97 |
| 44341.583333333336 | 3.01 |
| 44341.59375 | 2.83 |
| 44341.604166666664 | 3.06 |
| 44341.614583333336 | 3.07 |
| 44341.625 | 2.92 |
| 44341.635416666664 | 3.27 |
| 44341.645833333336 | 3.32 |
| 44341.65625 | 3.29 |
| 44341.666666666664 | 3.45 |
| 44341.677083333336 | 3.68 |
| 44341.6875 | 3.74 |
| 44341.697916666664 | 3.91 |
| 44341.708333333336 | 4.26 |
| 44341.71875 | 4.53 |
| 44341.729166666664 | 5.13 |
| 44341.739583333336 | 5.39 |
| 44341.75 | 5.98 |
| 44341.760416666664 | 6.34 |
| 44341.770833333336 | 6.87 |
| 44341.78125 | 7.32 |
| 44341.791666666664 | 5.79 |
| 44341.802083333336 | 6.63 |
| 44341.8125 | 6.73 |
| 44341.822916666664 | 5.61 |
| 44341.833333333336 | 5.15 |
| 44341.84375 | 4.97 |
| 44341.854166666664 | 4.53 |
| 44341.864583333336 | 4.06 |
| 44341.875 | 3.49 |
| 44341.885416666664 | 3.44 |
| 44341.895833333336 | 3.36 |
| 44341.90625 | 3.34 |
| 44341.916666666664 | 3.41 |
| 44341.927083333336 | 3.51 |
| 44341.9375 | 3.71 |
| 44341.947916666664 | 3.74 |
| 44341.958333333336 | 3.61 |
| 44341.96875 | 3.53 |
| 44341.979166666664 | 3.58 |
| 44341.989583333336 | 3.61 |
| 44342.0 | 3.71 |
| 44342.010416666664 | 4.04 |
| 44342.020833333336 | 4.41 |
| 44342.03125 | 4.27 |
| 44342.041666666664 | 4.22 |
| 44342.052083333336 | 4.24 |
| 44342.0625 | 4.28 |
| 44342.072916666664 | 3.82 |
| 44342.083333333336 | 3.65 |
| 44342.09375 | 3.53 |
| 44342.104166666664 | 3.27 |
| 44342.114583333336 | 2.96 |
| 44342.125 | 3.14 |
| 44342.135416666664 | 2.96 |
| 44342.145833333336 | 2.98 |
| 44342.15625 | 2.81 |
| 44342.166666666664 | 2.75 |
| 44342.177083333336 | 2.98 |
| 44342.1875 | 2.93 |
| 44342.197916666664 | 2.99 |
| 44342.208333333336 | 3.36 |
| 44342.21875 | 3.01 |
| 44342.229166666664 | 2.81 |
| 44342.239583333336 | 3.06 |
| 44342.25 | 3.19 |
| 44342.260416666664 | 3.27 |
| 44342.270833333336 | 3.55 |
| 44342.28125 | 3.79 |
| 44342.291666666664 | 3.58 |
| 44342.302083333336 | 3.62 |
| 44342.3125 | 3.64 |
| 44342.322916666664 | 3.79 |
| 44342.333333333336 | 3.15 |
| 44342.34375 | 3.23 |
| 44342.354166666664 | 3.18 |
| 44342.364583333336 | 2.9 |
| 44342.375 | 3.17 |
| 44342.385416666664 | 3.29 |
| 44342.395833333336 | 2.98 |
| 44342.40625 | 2.99 |
| 44342.416666666664 | 2.89 |
| 44342.427083333336 | 2.94 |
| 44342.4375 | 2.86 |
| 44342.447916666664 | 2.81 |
| 44342.458333333336 | 2.9 |
| 44342.46875 | 2.72 |
| 44342.479166666664 | 2.67 |
| 44342.489583333336 | 2.67 |
| 44342.5 | 2.72 |
| 44342.510416666664 | 2.63 |
| 44342.520833333336 | 2.68 |
| 44342.53125 | 2.5 |
| 44342.541666666664 | 2.47 |
| 44342.552083333336 | 2.62 |
| 44342.5625 | 2.3 |
| 44342.572916666664 | 2.15 |
| 44342.583333333336 | 2.23 |
| 44342.59375 | 2.28 |
| 44342.604166666664 | 2.09 |
| 44342.614583333336 | 2.04 |
| 44342.625 | 1.84 |
| 44342.635416666664 | 1.89 |
| 44342.645833333336 | 1.92 |
| 44342.65625 | 2.1 |
| 44342.666666666664 | 2.3 |
| 44342.677083333336 | 2.47 |
| 44342.6875 | 2.43 |
| 44342.697916666664 | 2.78 |
| 44342.708333333336 | 2.84 |
| 44342.71875 | 2.79 |
| 44342.729166666664 | 3.61 |
| 44342.739583333336 | 3.83 |
| 44342.75 | 4.41 |
| 44342.760416666664 | 5.23 |
| 44342.770833333336 | 5.8 |
| 44342.78125 | 6.31 |
| 44342.791666666664 | 6.64 |
| 44342.802083333336 | 6.32 |
| 44342.8125 | 9.24 |
| 44342.822916666664 | 6.03 |
| 44342.833333333336 | 5.48 |
| 44342.84375 | 5.53 |
| 44342.854166666664 | 4.89 |
| 44342.864583333336 | 4.2 |
| 44342.875 | 3.8 |
| 44342.885416666664 | 3.46 |
| 44342.895833333336 | 3.95 |
| 44342.90625 | 4.19 |
| 44342.916666666664 | 4.46 |
| 44342.927083333336 | 4.58 |
| 44342.9375 | 4.47 |
| 44342.947916666664 | 4.26 |
| 44342.958333333336 | 3.95 |
| 44342.96875 | 3.84 |
| 44342.979166666664 | 3.61 |
| 44342.989583333336 | 3.58 |
| 44343.0 | 3.53 |
| 44343.010416666664 | 3.75 |
| 44343.020833333336 | 3.6 |
| 44343.03125 | 3.68 |
| 44343.041666666664 | 3.52 |
| 44343.052083333336 | 3.49 |
| 44343.0625 | 4.38 |
| 44343.072916666664 | 3.71 |
| 44343.083333333336 | 3.61 |
| 44343.09375 | 3 |
| 44343.104166666664 | 3.05 |
| 44343.114583333336 | 3.06 |
| 44343.125 | 2.89 |
| 44343.135416666664 | 2.73 |
| 44343.145833333336 | 2.68 |
| 44343.15625 | 2.58 |
| 44343.166666666664 | 2.64 |
| 44343.177083333336 | 2.27 |
| 44343.1875 | 2.34 |
| 44343.197916666664 | 2.31 |
| 44343.208333333336 | 2.65 |
| 44343.21875 | 2.79 |
| 44343.229166666664 | 2.95 |
| 44343.239583333336 | 3.06 |
| 44343.25 | 3.04 |
| 44343.260416666664 | 3.16 |
| 44343.270833333336 | 2.95 |
| 44343.28125 | 3.06 |
| 44343.291666666664 | 3.27 |
| 44343.302083333336 | 3.37 |
| 44343.3125 | 3.58 |
| 44343.322916666664 | 3.49 |
| 44343.333333333336 | 3.34 |
| 44343.34375 | 3.58 |
| 44343.354166666664 | 3.34 |
| 44343.364583333336 | 3.34 |
| 44343.375 | 3.02 |
| 44343.385416666664 | 2.78 |
| 44343.395833333336 | 3.05 |
| 44343.40625 | 3.09 |
| 44343.416666666664 | 3.36 |
| 44343.427083333336 | 3.29 |
| 44343.4375 | 3.02 |
| 44343.447916666664 | 2.89 |
| 44343.458333333336 | 2.85 |
| 44343.46875 | 2.71 |
| 44343.479166666664 | 2.55 |
| 44343.489583333336 | 2.77 |
| 44343.5 | 2.75 |
| 44343.510416666664 | 2.82 |
| 44343.520833333336 | 2.66 |
| 44343.53125 | 2.65 |
| 44343.541666666664 | 2.56 |
| 44343.552083333336 | 2.39 |
| 44343.5625 | 2.31 |
| 44343.572916666664 | 2.36 |
| 44343.583333333336 | 2.35 |
| 44343.59375 | 2.48 |
| 44343.604166666664 | 2.62 |
| 44343.614583333336 | 2.24 |
| 44343.625 | 2.18 |
| 44343.635416666664 | 2.25 |
| 44343.645833333336 | 2.09 |
| 44343.65625 | 2.02 |
| 44343.666666666664 | 2.18 |
| 44343.677083333336 | 2.22 |
| 44343.6875 | 2.26 |
| 44343.697916666664 | 2.51 |
| 44343.708333333336 | 2.67 |
| 44343.71875 | 2.75 |
| 44343.729166666664 | 2.84 |
| 44343.739583333336 | 3.54 |
| 44343.75 | 3.41 |
| 44343.760416666664 | 3.92 |
| 44343.770833333336 | 3.95 |
| 44343.78125 | 4.96 |
| 44343.791666666664 | 6.5 |
| 44343.802083333336 | 7.05 |
| 44343.8125 | 7.44 |
| 44343.822916666664 | 7.86 |
| 44343.833333333336 | 8.53 |
| 44343.84375 | 10.7 |
| 44343.854166666664 | 8.8 |
| 44343.864583333336 | 7.81 |
| 44343.875 | 7.26 |
| 44343.885416666664 | 6.82 |
| 44343.895833333336 | 6 |
| 44343.90625 | 5.74 |
| 44343.916666666664 | 5.05 |
| 44343.927083333336 | 4.18 |
| 44343.9375 | 3.28 |
| 44343.947916666664 | 2.95 |
| 44343.958333333336 | 2.39 |
| 44343.96875 | 2.48 |
| 44343.979166666664 | 3.09 |
| 44343.989583333336 | 3.46 |
| 44344.0 | 3.35 |
| 44344.010416666664 | 3.53 |
| 44344.020833333336 | 3.73 |
| 44344.03125 | 3.89 |
| 44344.041666666664 | 3.46 |
| 44344.052083333336 | 3.64 |
| 44344.0625 | 4.06 |
| 44344.072916666664 | 3.71 |
| 44344.083333333336 | 3.7 |
| 44344.09375 | 4.24 |
| 44344.104166666664 | 3.41 |
| 44344.114583333336 | 3.28 |
| 44344.125 | 3.63 |
| 44344.135416666664 | 3.29 |
| 44344.145833333336 | 3.18 |
| 44344.15625 | 3.07 |
| 44344.166666666664 | 3.04 |
| 44344.177083333336 | 2.78 |
| 44344.1875 | 2.72 |
| 44344.197916666664 | 2.71 |
| 44344.208333333336 | 2.65 |
| 44344.21875 | 2.46 |
| 44344.229166666664 | 2.65 |
| 44344.239583333336 | 2.5 |
| 44344.25 | 2.86 |
| 44344.260416666664 | 2.69 |
| 44344.270833333336 | 2.72 |
| 44344.28125 | 3.05 |
| 44344.291666666664 | 3.34 |
| 44344.302083333336 | 3.13 |
| 44344.3125 | 3.26 |
| 44344.322916666664 | 3.49 |
| 44344.333333333336 | 3.53 |
| 44344.34375 | 3.92 |
| 44344.354166666664 | 3.9 |
| 44344.364583333336 | 4.07 |
| 44344.375 | 4.3 |
| 44344.385416666664 | 5.5 |
| 44344.395833333336 | 3.97 |
| 44344.40625 | 4.13 |
| 44344.416666666664 | 4.04 |
| 44344.427083333336 | 3.46 |
| 44344.4375 | 3.34 |
| 44344.447916666664 | 3.06 |
| 44344.458333333336 | 3.07 |
| 44344.46875 | 2.86 |
| 44344.479166666664 | 2.68 |
| 44344.489583333336 | 2.64 |
| 44344.5 | 2.77 |
| 44344.510416666664 | 2.82 |
| 44344.520833333336 | 2.69 |
| 44344.53125 | 2.66 |
| 44344.541666666664 | 2.61 |
| 44344.552083333336 | 2.63 |
| 44344.5625 | 2.48 |
| 44344.572916666664 | 2.68 |
| 44344.583333333336 | 2.37 |
| 44344.59375 | 2.75 |
| 44344.604166666664 | 2.45 |
| 44344.614583333336 | 2.68 |
| 44344.625 | 2.63 |
| 44344.635416666664 | 2.42 |
| 44344.645833333336 | 2.81 |
| 44344.65625 | 2.42 |
| 44344.666666666664 | 2.32 |
| 44344.677083333336 | 2.48 |
| 44344.6875 | 2.2 |
| 44344.697916666664 | 2.2 |
| 44344.708333333336 | 2.32 |
| 44344.71875 | 2.25 |
| 44344.729166666664 | 2.52 |
| 44344.739583333336 | 2.39 |
| 44344.75 | 2.53 |
| 44344.760416666664 | 2.78 |
| 44344.770833333336 | 3.04 |
| 44344.78125 | 3.23 |
| 44344.791666666664 | 3.64 |
| 44344.802083333336 | 4.26 |
| 44344.8125 | 4.57 |
| 44344.822916666664 | 4.86 |
| 44344.833333333336 | 6.06 |
| 44344.84375 | 6.9 |
| 44344.854166666664 | 7.64 |
| 44344.864583333336 | 8.33 |
| 44344.875 | 8.7 |
| 44344.885416666664 | 8.06 |
| 44344.895833333336 | 7.79 |
| 44344.90625 | 7.56 |
| 44344.916666666664 | 6.27 |
| 44344.927083333336 | 6.29 |
| 44344.9375 | 5.59 |
| 44344.947916666664 | 5.02 |
| 44344.958333333336 | 4.88 |
| 44344.96875 | 4.77 |
| 44344.979166666664 | 4.43 |
| 44344.989583333336 | 4.72 |
| 44345.0 | 4.98 |
| 44345.010416666664 | 4.57 |
| 44345.020833333336 | 4.87 |
| 44345.03125 | 5.08 |
| 44345.041666666664 | 4.63 |
| 44345.052083333336 | 4.27 |
| 44345.0625 | 4.55 |
| 44345.072916666664 | 4.87 |
| 44345.083333333336 | 4.43 |
| 44345.09375 | 4.56 |
| 44345.104166666664 | 4.51 |
| 44345.114583333336 | 3.84 |
| 44345.125 | 4.34 |
| 44345.135416666664 | 3.88 |
| 44345.145833333336 | 3.98 |
| 44345.15625 | 4.12 |
| 44345.166666666664 | 4.12 |
| 44345.177083333336 | 4.21 |
| 44345.1875 | 3.44 |
| 44345.197916666664 | 3.32 |
| 44345.208333333336 | 3.15 |
| 44345.21875 | 3.22 |
| 44345.229166666664 | 2.79 |
| 44345.239583333336 | 3.24 |
| 44345.25 | 2.98 |
| 44345.260416666664 | 2.81 |
| 44345.270833333336 | 2.76 |
| 44345.28125 | 2.57 |
| 44345.291666666664 | 2.77 |
| 44345.302083333336 | 2.7 |
| 44345.3125 | 2.94 |
| 44345.322916666664 | 2.91 |
| 44345.333333333336 | 3.14 |
| 44345.34375 | 3.74 |
| 44345.354166666664 | 3.6 |
| 44345.364583333336 | 3.76 |
| 44345.375 | 4.31 |
| 44345.385416666664 | 4.61 |
| 44345.395833333336 | 4.27 |
| 44345.40625 | 4.37 |
| 44345.416666666664 | 4.11 |
| 44345.427083333336 | 5.72 |
| 44345.4375 | 4.35 |
| 44345.447916666664 | 3.99 |
| 44345.458333333336 | 3.63 |
| 44345.46875 | 3.43 |
| 44345.479166666664 | 3.27 |
| 44345.489583333336 | 3.17 |
| 44345.5 | 3.07 |
| 44345.510416666664 | 2.95 |
| 44345.520833333336 | 2.97 |
| 44345.53125 | 2.91 |
| 44345.541666666664 | 2.79 |
| 44345.552083333336 | 2.93 |
| 44345.5625 | 2.85 |
| 44345.572916666664 | 2.94 |
| 44345.583333333336 | 2.82 |
| 44345.59375 | 2.92 |
| 44345.604166666664 | 2.88 |
| 44345.614583333336 | 2.95 |
| 44345.625 | 2.79 |
| 44345.635416666664 | 2.92 |
| 44345.645833333336 | 2.78 |
| 44345.65625 | 2.78 |
| 44345.666666666664 | 2.66 |
| 44345.677083333336 | 2.5 |
| 44345.6875 | 2.68 |
| 44345.697916666664 | 3.11 |
| 44345.708333333336 | 3.05 |
| 44345.71875 | 3.18 |
| 44345.729166666664 | 3.28 |
| 44345.739583333336 | 3.23 |
| 44345.75 | 3.26 |
| 44345.760416666664 | 3.34 |
| 44345.770833333336 | 3.27 |
| 44345.78125 | 3.54 |
| 44345.791666666664 | 3.56 |
| 44345.802083333336 | 3.68 |
| 44345.8125 | 3.51 |
| 44345.822916666664 | 3.63 |
| 44345.833333333336 | 3.61 |
| 44345.84375 | 3.98 |
| 44345.854166666664 | 3.85 |
| 44345.864583333336 | 3.58 |
| 44345.875 | 3.75 |
| 44345.885416666664 | 3.74 |
| 44345.895833333336 | 4.07 |
| 44345.90625 | 4.1 |
| 44345.916666666664 | 4.61 |
| 44345.927083333336 | 4.73 |
| 44345.9375 | 4.79 |
| 44345.947916666664 | 4.4 |
| 44345.958333333336 | 4.63 |
| 44345.96875 | 4.51 |
| 44345.979166666664 | 4.25 |
| 44345.989583333336 | 4.12 |
| 44346.0 | 4.12 |
| 44346.010416666664 | 4.07 |
| 44346.020833333336 | 3.9 |
| 44346.03125 | 3.92 |
| 44346.041666666664 | 3.8 |
| 44346.052083333336 | 4.6 |
| 44346.0625 | 4.44 |
| 44346.072916666664 | 4.41 |
| 44346.083333333336 | 4.28 |
| 44346.09375 | 4.05 |
| 44346.104166666664 | 4.28 |
| 44346.114583333336 | 4.1 |
| 44346.125 | 4.14 |
| 44346.135416666664 | 4.15 |
| 44346.145833333336 | 4.08 |
| 44346.15625 | 3.76 |
| 44346.166666666664 | 3.69 |
| 44346.177083333336 | 3.53 |
| 44346.1875 | 3.71 |
| 44346.197916666664 | 3.86 |
| 44346.208333333336 | 3.33 |
| 44346.21875 | 3.12 |
| 44346.229166666664 | 3.04 |
| 44346.239583333336 | 3.14 |
| 44346.25 | 2.86 |
| 44346.260416666664 | 2.99 |
| 44346.270833333336 | 2.84 |
| 44346.28125 | 2.79 |
| 44346.291666666664 | 2.76 |
| 44346.302083333336 | 2.73 |
| 44346.3125 | 2.6 |
| 44346.322916666664 | 2.7 |
| 44346.333333333336 | 2.64 |
| 44346.34375 | 2.69 |
| 44346.354166666664 | 2.92 |
| 44346.364583333336 | 2.93 |
| 44346.375 | 2.67 |
| 44346.385416666664 | 3.51 |
| 44346.395833333336 | 2.72 |
| 44346.40625 | 3.27 |
| 44346.416666666664 | 3.61 |
| 44346.427083333336 | 3.62 |
| 44346.4375 | 3.58 |
| 44346.447916666664 | 3.51 |
| 44346.458333333336 | 3.39 |
| 44346.46875 | 3.5 |
| 44346.479166666664 | 3.47 |
| 44346.489583333336 | 4.23 |
| 44346.5 | 3.74 |
| 44346.510416666664 | 3.07 |
| 44346.520833333336 | 3.08 |
| 44346.53125 | 3.08 |
| 44346.541666666664 | 3.1 |
| 44346.552083333336 | 3.12 |
| 44346.5625 | 3.59 |
| 44346.572916666664 | 3.63 |
| 44346.583333333336 | 3.87 |
| 44346.59375 | 3.72 |
| 44346.604166666664 | 3.86 |
| 44346.614583333336 | 3.94 |
| 44346.625 | 3.86 |
| 44346.635416666664 | 3.66 |
| 44346.645833333336 | 3.7 |
| 44346.65625 | 3.46 |
| 44346.666666666664 | 3.27 |
| 44346.677083333336 | 3.15 |
| 44346.6875 | 3.19 |
| 44346.697916666664 | 3.28 |
| 44346.708333333336 | 5.93 |
| 44346.71875 | 2.85 |
| 44346.729166666664 | 2.52 |
| 44346.739583333336 | 3.03 |
| 44346.75 | 2.52 |
| 44346.760416666664 | 2.63 |
| 44346.770833333336 | 2.55 |
| 44346.78125 | 2.51 |
| 44346.791666666664 | 2.93 |
| 44346.802083333336 | 2.97 |
| 44346.8125 | 2.73 |
| 44346.822916666664 | 2.66 |
| 44346.833333333336 | 2.51 |
| 44346.84375 | 2.84 |
| 44346.854166666664 | 2.7 |
| 44346.864583333336 | 2.55 |
| 44346.875 | 2.79 |
| 44346.885416666664 | 2.8 |
| 44346.895833333336 | 3.05 |
| 44346.90625 | 3 |
| 44346.916666666664 | 2.85 |
| 44346.927083333336 | 2.88 |
| 44346.9375 | 2.91 |
| 44346.947916666664 | 3.03 |
| 44346.958333333336 | 3.28 |
| 44346.96875 | 3.38 |
| 44346.979166666664 | 3.04 |
| 44346.989583333336 | 3.02 |
| 44347.0 | 3.05 |
| 44347.010416666664 | 3.02 |
| 44347.020833333336 | 2.8 |
| 44347.03125 | 3.08 |
| 44347.041666666664 | 3.13 |
| 44347.052083333336 | 3.54 |
| 44347.0625 | 3.02 |
| 44347.072916666664 | 3 |
| 44347.083333333336 | 3.02 |
| 44347.09375 | 3.3 |
| 44347.104166666664 | 3.04 |
| 44347.114583333336 | 2.79 |
| 44347.125 | 2.7 |
| 44347.135416666664 | 3.01 |
| 44347.145833333336 | 3.19 |
| 44347.15625 | 3.4 |